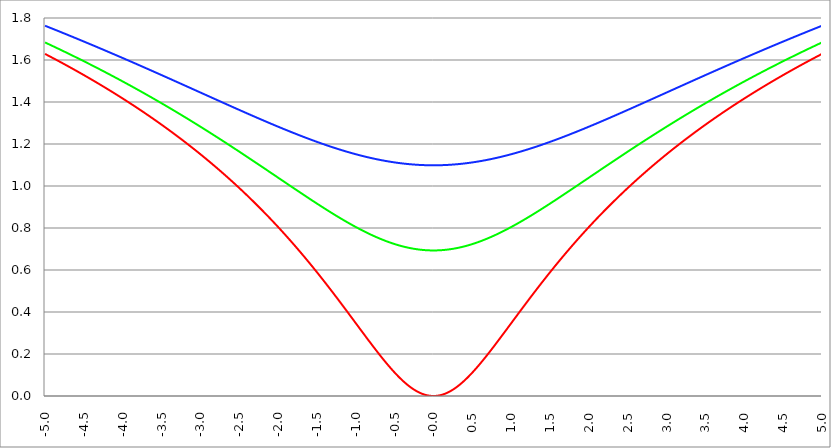
| Category | Series 1 | Series 0 | Series 2 |
|---|---|---|---|
| -5.0 | 1.629 | 1.684 | 1.763 |
| -4.995 | 1.628 | 1.683 | 1.762 |
| -4.99 | 1.627 | 1.682 | 1.762 |
| -4.985 | 1.626 | 1.681 | 1.761 |
| -4.98 | 1.625 | 1.68 | 1.76 |
| -4.975 | 1.624 | 1.679 | 1.759 |
| -4.97 | 1.623 | 1.678 | 1.759 |
| -4.965000000000001 | 1.622 | 1.678 | 1.758 |
| -4.960000000000001 | 1.621 | 1.677 | 1.757 |
| -4.955000000000001 | 1.62 | 1.676 | 1.757 |
| -4.950000000000001 | 1.619 | 1.675 | 1.756 |
| -4.945000000000001 | 1.618 | 1.674 | 1.755 |
| -4.940000000000001 | 1.617 | 1.673 | 1.754 |
| -4.935000000000001 | 1.616 | 1.672 | 1.754 |
| -4.930000000000001 | 1.615 | 1.672 | 1.753 |
| -4.925000000000002 | 1.615 | 1.671 | 1.752 |
| -4.920000000000002 | 1.614 | 1.67 | 1.751 |
| -4.915000000000002 | 1.613 | 1.669 | 1.751 |
| -4.910000000000002 | 1.612 | 1.668 | 1.75 |
| -4.905000000000002 | 1.611 | 1.667 | 1.749 |
| -4.900000000000002 | 1.61 | 1.666 | 1.748 |
| -4.895000000000002 | 1.609 | 1.665 | 1.748 |
| -4.890000000000002 | 1.608 | 1.665 | 1.747 |
| -4.885000000000002 | 1.607 | 1.664 | 1.746 |
| -4.880000000000002 | 1.606 | 1.663 | 1.745 |
| -4.875000000000003 | 1.605 | 1.662 | 1.745 |
| -4.870000000000003 | 1.604 | 1.661 | 1.744 |
| -4.865000000000003 | 1.603 | 1.66 | 1.743 |
| -4.860000000000003 | 1.602 | 1.659 | 1.742 |
| -4.855000000000003 | 1.601 | 1.658 | 1.742 |
| -4.850000000000003 | 1.6 | 1.658 | 1.741 |
| -4.845000000000003 | 1.599 | 1.657 | 1.74 |
| -4.840000000000003 | 1.598 | 1.656 | 1.739 |
| -4.835000000000003 | 1.597 | 1.655 | 1.739 |
| -4.830000000000004 | 1.596 | 1.654 | 1.738 |
| -4.825000000000004 | 1.595 | 1.653 | 1.737 |
| -4.820000000000004 | 1.594 | 1.652 | 1.736 |
| -4.815000000000004 | 1.593 | 1.651 | 1.736 |
| -4.810000000000004 | 1.592 | 1.65 | 1.735 |
| -4.805000000000004 | 1.591 | 1.65 | 1.734 |
| -4.800000000000004 | 1.59 | 1.649 | 1.733 |
| -4.795000000000004 | 1.589 | 1.648 | 1.733 |
| -4.790000000000004 | 1.588 | 1.647 | 1.732 |
| -4.785000000000004 | 1.587 | 1.646 | 1.731 |
| -4.780000000000004 | 1.586 | 1.645 | 1.73 |
| -4.775000000000004 | 1.585 | 1.644 | 1.73 |
| -4.770000000000004 | 1.584 | 1.643 | 1.729 |
| -4.765000000000005 | 1.583 | 1.642 | 1.728 |
| -4.760000000000005 | 1.582 | 1.642 | 1.727 |
| -4.755000000000005 | 1.581 | 1.641 | 1.727 |
| -4.750000000000005 | 1.58 | 1.64 | 1.726 |
| -4.745000000000005 | 1.579 | 1.639 | 1.725 |
| -4.740000000000005 | 1.578 | 1.638 | 1.724 |
| -4.735000000000005 | 1.577 | 1.637 | 1.724 |
| -4.730000000000005 | 1.576 | 1.636 | 1.723 |
| -4.725000000000006 | 1.575 | 1.635 | 1.722 |
| -4.720000000000006 | 1.574 | 1.634 | 1.721 |
| -4.715000000000006 | 1.573 | 1.633 | 1.721 |
| -4.710000000000006 | 1.572 | 1.633 | 1.72 |
| -4.705000000000006 | 1.571 | 1.632 | 1.719 |
| -4.700000000000006 | 1.57 | 1.631 | 1.718 |
| -4.695000000000006 | 1.569 | 1.63 | 1.718 |
| -4.690000000000006 | 1.568 | 1.629 | 1.717 |
| -4.685000000000007 | 1.567 | 1.628 | 1.716 |
| -4.680000000000007 | 1.566 | 1.627 | 1.715 |
| -4.675000000000007 | 1.565 | 1.626 | 1.715 |
| -4.670000000000007 | 1.564 | 1.625 | 1.714 |
| -4.665000000000007 | 1.563 | 1.624 | 1.713 |
| -4.660000000000007 | 1.562 | 1.624 | 1.712 |
| -4.655000000000007 | 1.56 | 1.623 | 1.712 |
| -4.650000000000007 | 1.559 | 1.622 | 1.711 |
| -4.645000000000007 | 1.558 | 1.621 | 1.71 |
| -4.640000000000008 | 1.557 | 1.62 | 1.709 |
| -4.635000000000008 | 1.556 | 1.619 | 1.709 |
| -4.630000000000008 | 1.555 | 1.618 | 1.708 |
| -4.625000000000008 | 1.554 | 1.617 | 1.707 |
| -4.620000000000008 | 1.553 | 1.616 | 1.706 |
| -4.615000000000008 | 1.552 | 1.615 | 1.706 |
| -4.610000000000008 | 1.551 | 1.614 | 1.705 |
| -4.605000000000008 | 1.55 | 1.614 | 1.704 |
| -4.600000000000008 | 1.549 | 1.613 | 1.703 |
| -4.595000000000009 | 1.548 | 1.612 | 1.702 |
| -4.590000000000009 | 1.547 | 1.611 | 1.702 |
| -4.585000000000009 | 1.546 | 1.61 | 1.701 |
| -4.580000000000009 | 1.545 | 1.609 | 1.7 |
| -4.57500000000001 | 1.544 | 1.608 | 1.699 |
| -4.57000000000001 | 1.543 | 1.607 | 1.699 |
| -4.565000000000009 | 1.542 | 1.606 | 1.698 |
| -4.560000000000009 | 1.541 | 1.605 | 1.697 |
| -4.555000000000009 | 1.54 | 1.604 | 1.696 |
| -4.55000000000001 | 1.539 | 1.603 | 1.696 |
| -4.54500000000001 | 1.538 | 1.603 | 1.695 |
| -4.54000000000001 | 1.537 | 1.602 | 1.694 |
| -4.53500000000001 | 1.536 | 1.601 | 1.693 |
| -4.53000000000001 | 1.535 | 1.6 | 1.693 |
| -4.52500000000001 | 1.533 | 1.599 | 1.692 |
| -4.52000000000001 | 1.532 | 1.598 | 1.691 |
| -4.51500000000001 | 1.531 | 1.597 | 1.69 |
| -4.51000000000001 | 1.53 | 1.596 | 1.689 |
| -4.505000000000011 | 1.529 | 1.595 | 1.689 |
| -4.500000000000011 | 1.528 | 1.594 | 1.688 |
| -4.495000000000011 | 1.527 | 1.593 | 1.687 |
| -4.490000000000011 | 1.526 | 1.592 | 1.686 |
| -4.485000000000011 | 1.525 | 1.591 | 1.686 |
| -4.480000000000011 | 1.524 | 1.59 | 1.685 |
| -4.475000000000011 | 1.523 | 1.59 | 1.684 |
| -4.470000000000011 | 1.522 | 1.589 | 1.683 |
| -4.465000000000011 | 1.521 | 1.588 | 1.683 |
| -4.460000000000011 | 1.52 | 1.587 | 1.682 |
| -4.455000000000012 | 1.519 | 1.586 | 1.681 |
| -4.450000000000012 | 1.518 | 1.585 | 1.68 |
| -4.445000000000012 | 1.516 | 1.584 | 1.679 |
| -4.440000000000012 | 1.515 | 1.583 | 1.679 |
| -4.435000000000012 | 1.514 | 1.582 | 1.678 |
| -4.430000000000012 | 1.513 | 1.581 | 1.677 |
| -4.425000000000012 | 1.512 | 1.58 | 1.676 |
| -4.420000000000012 | 1.511 | 1.579 | 1.676 |
| -4.415000000000012 | 1.51 | 1.578 | 1.675 |
| -4.410000000000013 | 1.509 | 1.577 | 1.674 |
| -4.405000000000013 | 1.508 | 1.576 | 1.673 |
| -4.400000000000013 | 1.507 | 1.576 | 1.672 |
| -4.395000000000013 | 1.506 | 1.575 | 1.672 |
| -4.390000000000013 | 1.505 | 1.574 | 1.671 |
| -4.385000000000013 | 1.504 | 1.573 | 1.67 |
| -4.380000000000013 | 1.502 | 1.572 | 1.669 |
| -4.375000000000013 | 1.501 | 1.571 | 1.669 |
| -4.370000000000013 | 1.5 | 1.57 | 1.668 |
| -4.365000000000013 | 1.499 | 1.569 | 1.667 |
| -4.360000000000014 | 1.498 | 1.568 | 1.666 |
| -4.355000000000014 | 1.497 | 1.567 | 1.665 |
| -4.350000000000014 | 1.496 | 1.566 | 1.665 |
| -4.345000000000014 | 1.495 | 1.565 | 1.664 |
| -4.340000000000014 | 1.494 | 1.564 | 1.663 |
| -4.335000000000014 | 1.493 | 1.563 | 1.662 |
| -4.330000000000014 | 1.492 | 1.562 | 1.662 |
| -4.325000000000014 | 1.49 | 1.561 | 1.661 |
| -4.320000000000014 | 1.489 | 1.56 | 1.66 |
| -4.315000000000015 | 1.488 | 1.559 | 1.659 |
| -4.310000000000015 | 1.487 | 1.558 | 1.658 |
| -4.305000000000015 | 1.486 | 1.557 | 1.658 |
| -4.300000000000015 | 1.485 | 1.557 | 1.657 |
| -4.295000000000015 | 1.484 | 1.556 | 1.656 |
| -4.290000000000015 | 1.483 | 1.555 | 1.655 |
| -4.285000000000015 | 1.482 | 1.554 | 1.655 |
| -4.280000000000015 | 1.481 | 1.553 | 1.654 |
| -4.275000000000015 | 1.479 | 1.552 | 1.653 |
| -4.270000000000015 | 1.478 | 1.551 | 1.652 |
| -4.265000000000016 | 1.477 | 1.55 | 1.651 |
| -4.260000000000016 | 1.476 | 1.549 | 1.651 |
| -4.255000000000016 | 1.475 | 1.548 | 1.65 |
| -4.250000000000016 | 1.474 | 1.547 | 1.649 |
| -4.245000000000016 | 1.473 | 1.546 | 1.648 |
| -4.240000000000016 | 1.472 | 1.545 | 1.648 |
| -4.235000000000016 | 1.471 | 1.544 | 1.647 |
| -4.230000000000016 | 1.469 | 1.543 | 1.646 |
| -4.225000000000017 | 1.468 | 1.542 | 1.645 |
| -4.220000000000017 | 1.467 | 1.541 | 1.644 |
| -4.215000000000017 | 1.466 | 1.54 | 1.644 |
| -4.210000000000017 | 1.465 | 1.539 | 1.643 |
| -4.205000000000017 | 1.464 | 1.538 | 1.642 |
| -4.200000000000017 | 1.463 | 1.537 | 1.641 |
| -4.195000000000017 | 1.462 | 1.536 | 1.64 |
| -4.190000000000017 | 1.46 | 1.535 | 1.64 |
| -4.185000000000017 | 1.459 | 1.534 | 1.639 |
| -4.180000000000017 | 1.458 | 1.533 | 1.638 |
| -4.175000000000018 | 1.457 | 1.532 | 1.637 |
| -4.170000000000018 | 1.456 | 1.531 | 1.636 |
| -4.165000000000018 | 1.455 | 1.53 | 1.636 |
| -4.160000000000018 | 1.454 | 1.529 | 1.635 |
| -4.155000000000018 | 1.452 | 1.529 | 1.634 |
| -4.150000000000018 | 1.451 | 1.528 | 1.633 |
| -4.145000000000018 | 1.45 | 1.527 | 1.633 |
| -4.140000000000018 | 1.449 | 1.526 | 1.632 |
| -4.135000000000018 | 1.448 | 1.525 | 1.631 |
| -4.130000000000019 | 1.447 | 1.524 | 1.63 |
| -4.125000000000019 | 1.446 | 1.523 | 1.629 |
| -4.120000000000019 | 1.444 | 1.522 | 1.629 |
| -4.115000000000019 | 1.443 | 1.521 | 1.628 |
| -4.110000000000019 | 1.442 | 1.52 | 1.627 |
| -4.105000000000019 | 1.441 | 1.519 | 1.626 |
| -4.100000000000019 | 1.44 | 1.518 | 1.625 |
| -4.095000000000019 | 1.439 | 1.517 | 1.625 |
| -4.090000000000019 | 1.438 | 1.516 | 1.624 |
| -4.085000000000019 | 1.436 | 1.515 | 1.623 |
| -4.08000000000002 | 1.435 | 1.514 | 1.622 |
| -4.07500000000002 | 1.434 | 1.513 | 1.621 |
| -4.07000000000002 | 1.433 | 1.512 | 1.621 |
| -4.06500000000002 | 1.432 | 1.511 | 1.62 |
| -4.06000000000002 | 1.431 | 1.51 | 1.619 |
| -4.05500000000002 | 1.429 | 1.509 | 1.618 |
| -4.05000000000002 | 1.428 | 1.508 | 1.617 |
| -4.04500000000002 | 1.427 | 1.507 | 1.617 |
| -4.04000000000002 | 1.426 | 1.506 | 1.616 |
| -4.03500000000002 | 1.425 | 1.505 | 1.615 |
| -4.03000000000002 | 1.424 | 1.504 | 1.614 |
| -4.025000000000021 | 1.422 | 1.503 | 1.613 |
| -4.020000000000021 | 1.421 | 1.502 | 1.613 |
| -4.015000000000021 | 1.42 | 1.501 | 1.612 |
| -4.010000000000021 | 1.419 | 1.5 | 1.611 |
| -4.005000000000021 | 1.418 | 1.499 | 1.61 |
| -4.000000000000021 | 1.417 | 1.498 | 1.609 |
| -3.995000000000021 | 1.415 | 1.497 | 1.609 |
| -3.990000000000021 | 1.414 | 1.496 | 1.608 |
| -3.985000000000022 | 1.413 | 1.495 | 1.607 |
| -3.980000000000022 | 1.412 | 1.494 | 1.606 |
| -3.975000000000022 | 1.411 | 1.493 | 1.605 |
| -3.970000000000022 | 1.41 | 1.492 | 1.605 |
| -3.965000000000022 | 1.408 | 1.491 | 1.604 |
| -3.960000000000022 | 1.407 | 1.49 | 1.603 |
| -3.955000000000022 | 1.406 | 1.489 | 1.602 |
| -3.950000000000022 | 1.405 | 1.488 | 1.601 |
| -3.945000000000022 | 1.404 | 1.487 | 1.601 |
| -3.940000000000023 | 1.402 | 1.486 | 1.6 |
| -3.935000000000023 | 1.401 | 1.485 | 1.599 |
| -3.930000000000023 | 1.4 | 1.484 | 1.598 |
| -3.925000000000023 | 1.399 | 1.483 | 1.597 |
| -3.920000000000023 | 1.398 | 1.482 | 1.597 |
| -3.915000000000023 | 1.396 | 1.481 | 1.596 |
| -3.910000000000023 | 1.395 | 1.48 | 1.595 |
| -3.905000000000023 | 1.394 | 1.479 | 1.594 |
| -3.900000000000023 | 1.393 | 1.478 | 1.593 |
| -3.895000000000023 | 1.392 | 1.477 | 1.593 |
| -3.890000000000024 | 1.39 | 1.476 | 1.592 |
| -3.885000000000024 | 1.389 | 1.475 | 1.591 |
| -3.880000000000024 | 1.388 | 1.474 | 1.59 |
| -3.875000000000024 | 1.387 | 1.473 | 1.589 |
| -3.870000000000024 | 1.386 | 1.472 | 1.589 |
| -3.865000000000024 | 1.384 | 1.471 | 1.588 |
| -3.860000000000024 | 1.383 | 1.47 | 1.587 |
| -3.855000000000024 | 1.382 | 1.469 | 1.586 |
| -3.850000000000024 | 1.381 | 1.468 | 1.585 |
| -3.845000000000025 | 1.379 | 1.467 | 1.585 |
| -3.840000000000025 | 1.378 | 1.465 | 1.584 |
| -3.835000000000025 | 1.377 | 1.464 | 1.583 |
| -3.830000000000025 | 1.376 | 1.463 | 1.582 |
| -3.825000000000025 | 1.375 | 1.462 | 1.581 |
| -3.820000000000025 | 1.373 | 1.461 | 1.58 |
| -3.815000000000025 | 1.372 | 1.46 | 1.58 |
| -3.810000000000025 | 1.371 | 1.459 | 1.579 |
| -3.805000000000025 | 1.37 | 1.458 | 1.578 |
| -3.800000000000026 | 1.368 | 1.457 | 1.577 |
| -3.795000000000026 | 1.367 | 1.456 | 1.576 |
| -3.790000000000026 | 1.366 | 1.455 | 1.576 |
| -3.785000000000026 | 1.365 | 1.454 | 1.575 |
| -3.780000000000026 | 1.364 | 1.453 | 1.574 |
| -3.775000000000026 | 1.362 | 1.452 | 1.573 |
| -3.770000000000026 | 1.361 | 1.451 | 1.572 |
| -3.765000000000026 | 1.36 | 1.45 | 1.572 |
| -3.760000000000026 | 1.359 | 1.449 | 1.571 |
| -3.755000000000026 | 1.357 | 1.448 | 1.57 |
| -3.750000000000027 | 1.356 | 1.447 | 1.569 |
| -3.745000000000027 | 1.355 | 1.446 | 1.568 |
| -3.740000000000027 | 1.354 | 1.445 | 1.567 |
| -3.735000000000027 | 1.352 | 1.444 | 1.567 |
| -3.730000000000027 | 1.351 | 1.443 | 1.566 |
| -3.725000000000027 | 1.35 | 1.442 | 1.565 |
| -3.720000000000027 | 1.349 | 1.441 | 1.564 |
| -3.715000000000027 | 1.347 | 1.44 | 1.563 |
| -3.710000000000027 | 1.346 | 1.439 | 1.563 |
| -3.705000000000028 | 1.345 | 1.438 | 1.562 |
| -3.700000000000028 | 1.344 | 1.436 | 1.561 |
| -3.695000000000028 | 1.342 | 1.435 | 1.56 |
| -3.690000000000028 | 1.341 | 1.434 | 1.559 |
| -3.685000000000028 | 1.34 | 1.433 | 1.559 |
| -3.680000000000028 | 1.339 | 1.432 | 1.558 |
| -3.675000000000028 | 1.337 | 1.431 | 1.557 |
| -3.670000000000028 | 1.336 | 1.43 | 1.556 |
| -3.665000000000028 | 1.335 | 1.429 | 1.555 |
| -3.660000000000028 | 1.333 | 1.428 | 1.554 |
| -3.655000000000029 | 1.332 | 1.427 | 1.554 |
| -3.650000000000029 | 1.331 | 1.426 | 1.553 |
| -3.645000000000029 | 1.33 | 1.425 | 1.552 |
| -3.640000000000029 | 1.328 | 1.424 | 1.551 |
| -3.635000000000029 | 1.327 | 1.423 | 1.55 |
| -3.630000000000029 | 1.326 | 1.422 | 1.55 |
| -3.625000000000029 | 1.325 | 1.421 | 1.549 |
| -3.620000000000029 | 1.323 | 1.42 | 1.548 |
| -3.615000000000029 | 1.322 | 1.419 | 1.547 |
| -3.61000000000003 | 1.321 | 1.418 | 1.546 |
| -3.60500000000003 | 1.319 | 1.416 | 1.545 |
| -3.60000000000003 | 1.318 | 1.415 | 1.545 |
| -3.59500000000003 | 1.317 | 1.414 | 1.544 |
| -3.59000000000003 | 1.316 | 1.413 | 1.543 |
| -3.58500000000003 | 1.314 | 1.412 | 1.542 |
| -3.58000000000003 | 1.313 | 1.411 | 1.541 |
| -3.57500000000003 | 1.312 | 1.41 | 1.541 |
| -3.57000000000003 | 1.31 | 1.409 | 1.54 |
| -3.565000000000031 | 1.309 | 1.408 | 1.539 |
| -3.560000000000031 | 1.308 | 1.407 | 1.538 |
| -3.555000000000031 | 1.306 | 1.406 | 1.537 |
| -3.550000000000031 | 1.305 | 1.405 | 1.536 |
| -3.545000000000031 | 1.304 | 1.404 | 1.536 |
| -3.540000000000031 | 1.303 | 1.403 | 1.535 |
| -3.535000000000031 | 1.301 | 1.402 | 1.534 |
| -3.530000000000031 | 1.3 | 1.4 | 1.533 |
| -3.525000000000031 | 1.299 | 1.399 | 1.532 |
| -3.520000000000032 | 1.297 | 1.398 | 1.531 |
| -3.515000000000032 | 1.296 | 1.397 | 1.531 |
| -3.510000000000032 | 1.295 | 1.396 | 1.53 |
| -3.505000000000032 | 1.293 | 1.395 | 1.529 |
| -3.500000000000032 | 1.292 | 1.394 | 1.528 |
| -3.495000000000032 | 1.291 | 1.393 | 1.527 |
| -3.490000000000032 | 1.289 | 1.392 | 1.527 |
| -3.485000000000032 | 1.288 | 1.391 | 1.526 |
| -3.480000000000032 | 1.287 | 1.39 | 1.525 |
| -3.475000000000032 | 1.285 | 1.389 | 1.524 |
| -3.470000000000033 | 1.284 | 1.388 | 1.523 |
| -3.465000000000033 | 1.283 | 1.386 | 1.522 |
| -3.460000000000033 | 1.281 | 1.385 | 1.522 |
| -3.455000000000033 | 1.28 | 1.384 | 1.521 |
| -3.450000000000033 | 1.279 | 1.383 | 1.52 |
| -3.445000000000033 | 1.277 | 1.382 | 1.519 |
| -3.440000000000033 | 1.276 | 1.381 | 1.518 |
| -3.435000000000033 | 1.275 | 1.38 | 1.517 |
| -3.430000000000033 | 1.273 | 1.379 | 1.517 |
| -3.425000000000034 | 1.272 | 1.378 | 1.516 |
| -3.420000000000034 | 1.271 | 1.377 | 1.515 |
| -3.415000000000034 | 1.269 | 1.376 | 1.514 |
| -3.410000000000034 | 1.268 | 1.375 | 1.513 |
| -3.405000000000034 | 1.267 | 1.373 | 1.513 |
| -3.400000000000034 | 1.265 | 1.372 | 1.512 |
| -3.395000000000034 | 1.264 | 1.371 | 1.511 |
| -3.390000000000034 | 1.263 | 1.37 | 1.51 |
| -3.385000000000034 | 1.261 | 1.369 | 1.509 |
| -3.380000000000034 | 1.26 | 1.368 | 1.508 |
| -3.375000000000035 | 1.258 | 1.367 | 1.508 |
| -3.370000000000035 | 1.257 | 1.366 | 1.507 |
| -3.365000000000035 | 1.256 | 1.365 | 1.506 |
| -3.360000000000035 | 1.254 | 1.364 | 1.505 |
| -3.355000000000035 | 1.253 | 1.362 | 1.504 |
| -3.350000000000035 | 1.252 | 1.361 | 1.503 |
| -3.345000000000035 | 1.25 | 1.36 | 1.503 |
| -3.340000000000035 | 1.249 | 1.359 | 1.502 |
| -3.335000000000035 | 1.248 | 1.358 | 1.501 |
| -3.330000000000036 | 1.246 | 1.357 | 1.5 |
| -3.325000000000036 | 1.245 | 1.356 | 1.499 |
| -3.320000000000036 | 1.243 | 1.355 | 1.498 |
| -3.315000000000036 | 1.242 | 1.354 | 1.498 |
| -3.310000000000036 | 1.241 | 1.353 | 1.497 |
| -3.305000000000036 | 1.239 | 1.351 | 1.496 |
| -3.300000000000036 | 1.238 | 1.35 | 1.495 |
| -3.295000000000036 | 1.236 | 1.349 | 1.494 |
| -3.290000000000036 | 1.235 | 1.348 | 1.493 |
| -3.285000000000036 | 1.234 | 1.347 | 1.493 |
| -3.280000000000036 | 1.232 | 1.346 | 1.492 |
| -3.275000000000037 | 1.231 | 1.345 | 1.491 |
| -3.270000000000037 | 1.229 | 1.344 | 1.49 |
| -3.265000000000037 | 1.228 | 1.343 | 1.489 |
| -3.260000000000037 | 1.227 | 1.341 | 1.488 |
| -3.255000000000037 | 1.225 | 1.34 | 1.488 |
| -3.250000000000037 | 1.224 | 1.339 | 1.487 |
| -3.245000000000037 | 1.222 | 1.338 | 1.486 |
| -3.240000000000037 | 1.221 | 1.337 | 1.485 |
| -3.235000000000038 | 1.22 | 1.336 | 1.484 |
| -3.230000000000038 | 1.218 | 1.335 | 1.483 |
| -3.225000000000038 | 1.217 | 1.334 | 1.483 |
| -3.220000000000038 | 1.215 | 1.333 | 1.482 |
| -3.215000000000038 | 1.214 | 1.331 | 1.481 |
| -3.210000000000038 | 1.213 | 1.33 | 1.48 |
| -3.205000000000038 | 1.211 | 1.329 | 1.479 |
| -3.200000000000038 | 1.21 | 1.328 | 1.478 |
| -3.195000000000038 | 1.208 | 1.327 | 1.478 |
| -3.190000000000039 | 1.207 | 1.326 | 1.477 |
| -3.185000000000039 | 1.205 | 1.325 | 1.476 |
| -3.180000000000039 | 1.204 | 1.324 | 1.475 |
| -3.175000000000039 | 1.203 | 1.322 | 1.474 |
| -3.170000000000039 | 1.201 | 1.321 | 1.474 |
| -3.16500000000004 | 1.2 | 1.32 | 1.473 |
| -3.16000000000004 | 1.198 | 1.319 | 1.472 |
| -3.155000000000039 | 1.197 | 1.318 | 1.471 |
| -3.150000000000039 | 1.195 | 1.317 | 1.47 |
| -3.14500000000004 | 1.194 | 1.316 | 1.469 |
| -3.14000000000004 | 1.193 | 1.314 | 1.469 |
| -3.13500000000004 | 1.191 | 1.313 | 1.468 |
| -3.13000000000004 | 1.19 | 1.312 | 1.467 |
| -3.12500000000004 | 1.188 | 1.311 | 1.466 |
| -3.12000000000004 | 1.187 | 1.31 | 1.465 |
| -3.11500000000004 | 1.185 | 1.309 | 1.464 |
| -3.11000000000004 | 1.184 | 1.308 | 1.464 |
| -3.10500000000004 | 1.182 | 1.307 | 1.463 |
| -3.10000000000004 | 1.181 | 1.305 | 1.462 |
| -3.095000000000041 | 1.179 | 1.304 | 1.461 |
| -3.090000000000041 | 1.178 | 1.303 | 1.46 |
| -3.085000000000041 | 1.177 | 1.302 | 1.459 |
| -3.080000000000041 | 1.175 | 1.301 | 1.459 |
| -3.075000000000041 | 1.174 | 1.3 | 1.458 |
| -3.070000000000041 | 1.172 | 1.299 | 1.457 |
| -3.065000000000041 | 1.171 | 1.297 | 1.456 |
| -3.060000000000041 | 1.169 | 1.296 | 1.455 |
| -3.055000000000041 | 1.168 | 1.295 | 1.454 |
| -3.050000000000042 | 1.166 | 1.294 | 1.454 |
| -3.045000000000042 | 1.165 | 1.293 | 1.453 |
| -3.040000000000042 | 1.163 | 1.292 | 1.452 |
| -3.035000000000042 | 1.162 | 1.291 | 1.451 |
| -3.030000000000042 | 1.16 | 1.289 | 1.45 |
| -3.025000000000042 | 1.159 | 1.288 | 1.449 |
| -3.020000000000042 | 1.157 | 1.287 | 1.449 |
| -3.015000000000042 | 1.156 | 1.286 | 1.448 |
| -3.010000000000042 | 1.154 | 1.285 | 1.447 |
| -3.005000000000043 | 1.153 | 1.284 | 1.446 |
| -3.000000000000043 | 1.151 | 1.282 | 1.445 |
| -2.995000000000043 | 1.15 | 1.281 | 1.444 |
| -2.990000000000043 | 1.148 | 1.28 | 1.444 |
| -2.985000000000043 | 1.147 | 1.279 | 1.443 |
| -2.980000000000043 | 1.145 | 1.278 | 1.442 |
| -2.975000000000043 | 1.144 | 1.277 | 1.441 |
| -2.970000000000043 | 1.142 | 1.276 | 1.44 |
| -2.965000000000043 | 1.141 | 1.274 | 1.439 |
| -2.960000000000043 | 1.139 | 1.273 | 1.439 |
| -2.955000000000044 | 1.138 | 1.272 | 1.438 |
| -2.950000000000044 | 1.136 | 1.271 | 1.437 |
| -2.945000000000044 | 1.135 | 1.27 | 1.436 |
| -2.940000000000044 | 1.133 | 1.269 | 1.435 |
| -2.935000000000044 | 1.132 | 1.267 | 1.434 |
| -2.930000000000044 | 1.13 | 1.266 | 1.434 |
| -2.925000000000044 | 1.129 | 1.265 | 1.433 |
| -2.920000000000044 | 1.127 | 1.264 | 1.432 |
| -2.915000000000044 | 1.125 | 1.263 | 1.431 |
| -2.910000000000045 | 1.124 | 1.262 | 1.43 |
| -2.905000000000045 | 1.122 | 1.26 | 1.429 |
| -2.900000000000045 | 1.121 | 1.259 | 1.429 |
| -2.895000000000045 | 1.119 | 1.258 | 1.428 |
| -2.890000000000045 | 1.118 | 1.257 | 1.427 |
| -2.885000000000045 | 1.116 | 1.256 | 1.426 |
| -2.880000000000045 | 1.115 | 1.255 | 1.425 |
| -2.875000000000045 | 1.113 | 1.253 | 1.424 |
| -2.870000000000045 | 1.112 | 1.252 | 1.424 |
| -2.865000000000045 | 1.11 | 1.251 | 1.423 |
| -2.860000000000046 | 1.108 | 1.25 | 1.422 |
| -2.855000000000046 | 1.107 | 1.249 | 1.421 |
| -2.850000000000046 | 1.105 | 1.248 | 1.42 |
| -2.845000000000046 | 1.104 | 1.246 | 1.419 |
| -2.840000000000046 | 1.102 | 1.245 | 1.419 |
| -2.835000000000046 | 1.101 | 1.244 | 1.418 |
| -2.830000000000046 | 1.099 | 1.243 | 1.417 |
| -2.825000000000046 | 1.098 | 1.242 | 1.416 |
| -2.820000000000046 | 1.096 | 1.24 | 1.415 |
| -2.815000000000047 | 1.094 | 1.239 | 1.414 |
| -2.810000000000047 | 1.093 | 1.238 | 1.414 |
| -2.805000000000047 | 1.091 | 1.237 | 1.413 |
| -2.800000000000047 | 1.09 | 1.236 | 1.412 |
| -2.795000000000047 | 1.088 | 1.235 | 1.411 |
| -2.790000000000047 | 1.086 | 1.233 | 1.41 |
| -2.785000000000047 | 1.085 | 1.232 | 1.409 |
| -2.780000000000047 | 1.083 | 1.231 | 1.409 |
| -2.775000000000047 | 1.082 | 1.23 | 1.408 |
| -2.770000000000047 | 1.08 | 1.229 | 1.407 |
| -2.765000000000048 | 1.079 | 1.227 | 1.406 |
| -2.760000000000048 | 1.077 | 1.226 | 1.405 |
| -2.755000000000048 | 1.075 | 1.225 | 1.404 |
| -2.750000000000048 | 1.074 | 1.224 | 1.404 |
| -2.745000000000048 | 1.072 | 1.223 | 1.403 |
| -2.740000000000048 | 1.07 | 1.222 | 1.402 |
| -2.735000000000048 | 1.069 | 1.22 | 1.401 |
| -2.730000000000048 | 1.067 | 1.219 | 1.4 |
| -2.725000000000048 | 1.066 | 1.218 | 1.399 |
| -2.720000000000049 | 1.064 | 1.217 | 1.399 |
| -2.715000000000049 | 1.062 | 1.216 | 1.398 |
| -2.710000000000049 | 1.061 | 1.214 | 1.397 |
| -2.705000000000049 | 1.059 | 1.213 | 1.396 |
| -2.700000000000049 | 1.058 | 1.212 | 1.395 |
| -2.695000000000049 | 1.056 | 1.211 | 1.394 |
| -2.690000000000049 | 1.054 | 1.21 | 1.394 |
| -2.685000000000049 | 1.053 | 1.208 | 1.393 |
| -2.680000000000049 | 1.051 | 1.207 | 1.392 |
| -2.675000000000049 | 1.049 | 1.206 | 1.391 |
| -2.67000000000005 | 1.048 | 1.205 | 1.39 |
| -2.66500000000005 | 1.046 | 1.204 | 1.389 |
| -2.66000000000005 | 1.044 | 1.202 | 1.389 |
| -2.65500000000005 | 1.043 | 1.201 | 1.388 |
| -2.65000000000005 | 1.041 | 1.2 | 1.387 |
| -2.64500000000005 | 1.039 | 1.199 | 1.386 |
| -2.64000000000005 | 1.038 | 1.198 | 1.385 |
| -2.63500000000005 | 1.036 | 1.196 | 1.385 |
| -2.63000000000005 | 1.034 | 1.195 | 1.384 |
| -2.625000000000051 | 1.033 | 1.194 | 1.383 |
| -2.620000000000051 | 1.031 | 1.193 | 1.382 |
| -2.615000000000051 | 1.03 | 1.192 | 1.381 |
| -2.610000000000051 | 1.028 | 1.19 | 1.38 |
| -2.605000000000051 | 1.026 | 1.189 | 1.38 |
| -2.600000000000051 | 1.024 | 1.188 | 1.379 |
| -2.595000000000051 | 1.023 | 1.187 | 1.378 |
| -2.590000000000051 | 1.021 | 1.186 | 1.377 |
| -2.585000000000051 | 1.019 | 1.184 | 1.376 |
| -2.580000000000052 | 1.018 | 1.183 | 1.375 |
| -2.575000000000052 | 1.016 | 1.182 | 1.375 |
| -2.570000000000052 | 1.014 | 1.181 | 1.374 |
| -2.565000000000052 | 1.013 | 1.179 | 1.373 |
| -2.560000000000052 | 1.011 | 1.178 | 1.372 |
| -2.555000000000052 | 1.009 | 1.177 | 1.371 |
| -2.550000000000052 | 1.008 | 1.176 | 1.371 |
| -2.545000000000052 | 1.006 | 1.175 | 1.37 |
| -2.540000000000052 | 1.004 | 1.173 | 1.369 |
| -2.535000000000053 | 1.003 | 1.172 | 1.368 |
| -2.530000000000053 | 1.001 | 1.171 | 1.367 |
| -2.525000000000053 | 0.999 | 1.17 | 1.366 |
| -2.520000000000053 | 0.997 | 1.169 | 1.366 |
| -2.515000000000053 | 0.996 | 1.167 | 1.365 |
| -2.510000000000053 | 0.994 | 1.166 | 1.364 |
| -2.505000000000053 | 0.992 | 1.165 | 1.363 |
| -2.500000000000053 | 0.991 | 1.164 | 1.362 |
| -2.495000000000053 | 0.989 | 1.162 | 1.361 |
| -2.490000000000053 | 0.987 | 1.161 | 1.361 |
| -2.485000000000054 | 0.985 | 1.16 | 1.36 |
| -2.480000000000054 | 0.984 | 1.159 | 1.359 |
| -2.475000000000054 | 0.982 | 1.158 | 1.358 |
| -2.470000000000054 | 0.98 | 1.156 | 1.357 |
| -2.465000000000054 | 0.978 | 1.155 | 1.357 |
| -2.460000000000054 | 0.977 | 1.154 | 1.356 |
| -2.455000000000054 | 0.975 | 1.153 | 1.355 |
| -2.450000000000054 | 0.973 | 1.151 | 1.354 |
| -2.445000000000054 | 0.971 | 1.15 | 1.353 |
| -2.440000000000055 | 0.97 | 1.149 | 1.352 |
| -2.435000000000055 | 0.968 | 1.148 | 1.352 |
| -2.430000000000055 | 0.966 | 1.147 | 1.351 |
| -2.425000000000055 | 0.964 | 1.145 | 1.35 |
| -2.420000000000055 | 0.963 | 1.144 | 1.349 |
| -2.415000000000055 | 0.961 | 1.143 | 1.348 |
| -2.410000000000055 | 0.959 | 1.142 | 1.348 |
| -2.405000000000055 | 0.957 | 1.14 | 1.347 |
| -2.400000000000055 | 0.956 | 1.139 | 1.346 |
| -2.395000000000055 | 0.954 | 1.138 | 1.345 |
| -2.390000000000056 | 0.952 | 1.137 | 1.344 |
| -2.385000000000056 | 0.95 | 1.135 | 1.344 |
| -2.380000000000056 | 0.948 | 1.134 | 1.343 |
| -2.375000000000056 | 0.947 | 1.133 | 1.342 |
| -2.370000000000056 | 0.945 | 1.132 | 1.341 |
| -2.365000000000056 | 0.943 | 1.131 | 1.34 |
| -2.360000000000056 | 0.941 | 1.129 | 1.339 |
| -2.355000000000056 | 0.939 | 1.128 | 1.339 |
| -2.350000000000056 | 0.938 | 1.127 | 1.338 |
| -2.345000000000057 | 0.936 | 1.126 | 1.337 |
| -2.340000000000057 | 0.934 | 1.124 | 1.336 |
| -2.335000000000057 | 0.932 | 1.123 | 1.335 |
| -2.330000000000057 | 0.93 | 1.122 | 1.335 |
| -2.325000000000057 | 0.929 | 1.121 | 1.334 |
| -2.320000000000057 | 0.927 | 1.119 | 1.333 |
| -2.315000000000057 | 0.925 | 1.118 | 1.332 |
| -2.310000000000057 | 0.923 | 1.117 | 1.331 |
| -2.305000000000057 | 0.921 | 1.116 | 1.331 |
| -2.300000000000058 | 0.919 | 1.114 | 1.33 |
| -2.295000000000058 | 0.918 | 1.113 | 1.329 |
| -2.290000000000058 | 0.916 | 1.112 | 1.328 |
| -2.285000000000058 | 0.914 | 1.111 | 1.327 |
| -2.280000000000058 | 0.912 | 1.11 | 1.327 |
| -2.275000000000058 | 0.91 | 1.108 | 1.326 |
| -2.270000000000058 | 0.908 | 1.107 | 1.325 |
| -2.265000000000058 | 0.907 | 1.106 | 1.324 |
| -2.260000000000058 | 0.905 | 1.105 | 1.323 |
| -2.255000000000058 | 0.903 | 1.103 | 1.323 |
| -2.250000000000059 | 0.901 | 1.102 | 1.322 |
| -2.245000000000059 | 0.899 | 1.101 | 1.321 |
| -2.240000000000059 | 0.897 | 1.1 | 1.32 |
| -2.235000000000059 | 0.895 | 1.098 | 1.319 |
| -2.23000000000006 | 0.894 | 1.097 | 1.319 |
| -2.22500000000006 | 0.892 | 1.096 | 1.318 |
| -2.22000000000006 | 0.89 | 1.095 | 1.317 |
| -2.215000000000059 | 0.888 | 1.093 | 1.316 |
| -2.210000000000059 | 0.886 | 1.092 | 1.315 |
| -2.20500000000006 | 0.884 | 1.091 | 1.315 |
| -2.20000000000006 | 0.882 | 1.09 | 1.314 |
| -2.19500000000006 | 0.88 | 1.088 | 1.313 |
| -2.19000000000006 | 0.879 | 1.087 | 1.312 |
| -2.18500000000006 | 0.877 | 1.086 | 1.311 |
| -2.18000000000006 | 0.875 | 1.085 | 1.311 |
| -2.17500000000006 | 0.873 | 1.083 | 1.31 |
| -2.17000000000006 | 0.871 | 1.082 | 1.309 |
| -2.16500000000006 | 0.869 | 1.081 | 1.308 |
| -2.160000000000061 | 0.867 | 1.08 | 1.307 |
| -2.155000000000061 | 0.865 | 1.078 | 1.307 |
| -2.150000000000061 | 0.863 | 1.077 | 1.306 |
| -2.145000000000061 | 0.861 | 1.076 | 1.305 |
| -2.140000000000061 | 0.86 | 1.075 | 1.304 |
| -2.135000000000061 | 0.858 | 1.073 | 1.303 |
| -2.130000000000061 | 0.856 | 1.072 | 1.303 |
| -2.125000000000061 | 0.854 | 1.071 | 1.302 |
| -2.120000000000061 | 0.852 | 1.07 | 1.301 |
| -2.115000000000061 | 0.85 | 1.068 | 1.3 |
| -2.110000000000062 | 0.848 | 1.067 | 1.3 |
| -2.105000000000062 | 0.846 | 1.066 | 1.299 |
| -2.100000000000062 | 0.844 | 1.065 | 1.298 |
| -2.095000000000062 | 0.842 | 1.063 | 1.297 |
| -2.090000000000062 | 0.84 | 1.062 | 1.296 |
| -2.085000000000062 | 0.838 | 1.061 | 1.296 |
| -2.080000000000062 | 0.836 | 1.06 | 1.295 |
| -2.075000000000062 | 0.834 | 1.058 | 1.294 |
| -2.070000000000062 | 0.832 | 1.057 | 1.293 |
| -2.065000000000063 | 0.83 | 1.056 | 1.293 |
| -2.060000000000063 | 0.829 | 1.055 | 1.292 |
| -2.055000000000063 | 0.827 | 1.053 | 1.291 |
| -2.050000000000063 | 0.825 | 1.052 | 1.29 |
| -2.045000000000063 | 0.823 | 1.051 | 1.289 |
| -2.040000000000063 | 0.821 | 1.05 | 1.289 |
| -2.035000000000063 | 0.819 | 1.048 | 1.288 |
| -2.030000000000063 | 0.817 | 1.047 | 1.287 |
| -2.025000000000063 | 0.815 | 1.046 | 1.286 |
| -2.020000000000064 | 0.813 | 1.045 | 1.286 |
| -2.015000000000064 | 0.811 | 1.043 | 1.285 |
| -2.010000000000064 | 0.809 | 1.042 | 1.284 |
| -2.005000000000064 | 0.807 | 1.041 | 1.283 |
| -2.000000000000064 | 0.805 | 1.04 | 1.282 |
| -1.995000000000064 | 0.803 | 1.038 | 1.282 |
| -1.990000000000064 | 0.801 | 1.037 | 1.281 |
| -1.985000000000064 | 0.799 | 1.036 | 1.28 |
| -1.980000000000064 | 0.797 | 1.035 | 1.279 |
| -1.975000000000064 | 0.795 | 1.033 | 1.279 |
| -1.970000000000065 | 0.793 | 1.032 | 1.278 |
| -1.965000000000065 | 0.791 | 1.031 | 1.277 |
| -1.960000000000065 | 0.789 | 1.03 | 1.276 |
| -1.955000000000065 | 0.787 | 1.028 | 1.276 |
| -1.950000000000065 | 0.785 | 1.027 | 1.275 |
| -1.945000000000065 | 0.783 | 1.026 | 1.274 |
| -1.940000000000065 | 0.781 | 1.025 | 1.273 |
| -1.935000000000065 | 0.778 | 1.023 | 1.273 |
| -1.930000000000065 | 0.776 | 1.022 | 1.272 |
| -1.925000000000066 | 0.774 | 1.021 | 1.271 |
| -1.920000000000066 | 0.772 | 1.02 | 1.27 |
| -1.915000000000066 | 0.77 | 1.018 | 1.27 |
| -1.910000000000066 | 0.768 | 1.017 | 1.269 |
| -1.905000000000066 | 0.766 | 1.016 | 1.268 |
| -1.900000000000066 | 0.764 | 1.015 | 1.267 |
| -1.895000000000066 | 0.762 | 1.013 | 1.266 |
| -1.890000000000066 | 0.76 | 1.012 | 1.266 |
| -1.885000000000066 | 0.758 | 1.011 | 1.265 |
| -1.880000000000066 | 0.756 | 1.01 | 1.264 |
| -1.875000000000067 | 0.754 | 1.008 | 1.263 |
| -1.870000000000067 | 0.752 | 1.007 | 1.263 |
| -1.865000000000067 | 0.75 | 1.006 | 1.262 |
| -1.860000000000067 | 0.748 | 1.005 | 1.261 |
| -1.855000000000067 | 0.745 | 1.004 | 1.26 |
| -1.850000000000067 | 0.743 | 1.002 | 1.26 |
| -1.845000000000067 | 0.741 | 1.001 | 1.259 |
| -1.840000000000067 | 0.739 | 1 | 1.258 |
| -1.835000000000067 | 0.737 | 0.999 | 1.258 |
| -1.830000000000068 | 0.735 | 0.997 | 1.257 |
| -1.825000000000068 | 0.733 | 0.996 | 1.256 |
| -1.820000000000068 | 0.731 | 0.995 | 1.255 |
| -1.815000000000068 | 0.729 | 0.994 | 1.255 |
| -1.810000000000068 | 0.727 | 0.992 | 1.254 |
| -1.805000000000068 | 0.724 | 0.991 | 1.253 |
| -1.800000000000068 | 0.722 | 0.99 | 1.252 |
| -1.795000000000068 | 0.72 | 0.989 | 1.252 |
| -1.790000000000068 | 0.718 | 0.987 | 1.251 |
| -1.785000000000068 | 0.716 | 0.986 | 1.25 |
| -1.780000000000069 | 0.714 | 0.985 | 1.249 |
| -1.775000000000069 | 0.712 | 0.984 | 1.249 |
| -1.770000000000069 | 0.709 | 0.982 | 1.248 |
| -1.765000000000069 | 0.707 | 0.981 | 1.247 |
| -1.760000000000069 | 0.705 | 0.98 | 1.247 |
| -1.75500000000007 | 0.703 | 0.979 | 1.246 |
| -1.75000000000007 | 0.701 | 0.977 | 1.245 |
| -1.745000000000069 | 0.699 | 0.976 | 1.244 |
| -1.740000000000069 | 0.697 | 0.975 | 1.244 |
| -1.73500000000007 | 0.694 | 0.974 | 1.243 |
| -1.73000000000007 | 0.692 | 0.972 | 1.242 |
| -1.72500000000007 | 0.69 | 0.971 | 1.241 |
| -1.72000000000007 | 0.688 | 0.97 | 1.241 |
| -1.71500000000007 | 0.686 | 0.969 | 1.24 |
| -1.71000000000007 | 0.684 | 0.968 | 1.239 |
| -1.70500000000007 | 0.681 | 0.966 | 1.239 |
| -1.70000000000007 | 0.679 | 0.965 | 1.238 |
| -1.69500000000007 | 0.677 | 0.964 | 1.237 |
| -1.69000000000007 | 0.675 | 0.963 | 1.236 |
| -1.685000000000071 | 0.673 | 0.961 | 1.236 |
| -1.680000000000071 | 0.67 | 0.96 | 1.235 |
| -1.675000000000071 | 0.668 | 0.959 | 1.234 |
| -1.670000000000071 | 0.666 | 0.958 | 1.234 |
| -1.665000000000071 | 0.664 | 0.956 | 1.233 |
| -1.660000000000071 | 0.662 | 0.955 | 1.232 |
| -1.655000000000071 | 0.659 | 0.954 | 1.231 |
| -1.650000000000071 | 0.657 | 0.953 | 1.231 |
| -1.645000000000071 | 0.655 | 0.952 | 1.23 |
| -1.640000000000072 | 0.653 | 0.95 | 1.229 |
| -1.635000000000072 | 0.651 | 0.949 | 1.229 |
| -1.630000000000072 | 0.648 | 0.948 | 1.228 |
| -1.625000000000072 | 0.646 | 0.947 | 1.227 |
| -1.620000000000072 | 0.644 | 0.945 | 1.227 |
| -1.615000000000072 | 0.642 | 0.944 | 1.226 |
| -1.610000000000072 | 0.639 | 0.943 | 1.225 |
| -1.605000000000072 | 0.637 | 0.942 | 1.224 |
| -1.600000000000072 | 0.635 | 0.94 | 1.224 |
| -1.595000000000073 | 0.633 | 0.939 | 1.223 |
| -1.590000000000073 | 0.63 | 0.938 | 1.222 |
| -1.585000000000073 | 0.628 | 0.937 | 1.222 |
| -1.580000000000073 | 0.626 | 0.936 | 1.221 |
| -1.575000000000073 | 0.624 | 0.934 | 1.22 |
| -1.570000000000073 | 0.621 | 0.933 | 1.22 |
| -1.565000000000073 | 0.619 | 0.932 | 1.219 |
| -1.560000000000073 | 0.617 | 0.931 | 1.218 |
| -1.555000000000073 | 0.615 | 0.93 | 1.218 |
| -1.550000000000074 | 0.612 | 0.928 | 1.217 |
| -1.545000000000074 | 0.61 | 0.927 | 1.216 |
| -1.540000000000074 | 0.608 | 0.926 | 1.216 |
| -1.535000000000074 | 0.605 | 0.925 | 1.215 |
| -1.530000000000074 | 0.603 | 0.924 | 1.214 |
| -1.525000000000074 | 0.601 | 0.922 | 1.214 |
| -1.520000000000074 | 0.599 | 0.921 | 1.213 |
| -1.515000000000074 | 0.596 | 0.92 | 1.212 |
| -1.510000000000074 | 0.594 | 0.919 | 1.212 |
| -1.505000000000074 | 0.592 | 0.917 | 1.211 |
| -1.500000000000075 | 0.589 | 0.916 | 1.21 |
| -1.495000000000075 | 0.587 | 0.915 | 1.21 |
| -1.490000000000075 | 0.585 | 0.914 | 1.209 |
| -1.485000000000075 | 0.582 | 0.913 | 1.208 |
| -1.480000000000075 | 0.58 | 0.911 | 1.208 |
| -1.475000000000075 | 0.578 | 0.91 | 1.207 |
| -1.470000000000075 | 0.575 | 0.909 | 1.206 |
| -1.465000000000075 | 0.573 | 0.908 | 1.206 |
| -1.460000000000075 | 0.571 | 0.907 | 1.205 |
| -1.455000000000076 | 0.568 | 0.906 | 1.204 |
| -1.450000000000076 | 0.566 | 0.904 | 1.204 |
| -1.445000000000076 | 0.564 | 0.903 | 1.203 |
| -1.440000000000076 | 0.561 | 0.902 | 1.202 |
| -1.435000000000076 | 0.559 | 0.901 | 1.202 |
| -1.430000000000076 | 0.557 | 0.9 | 1.201 |
| -1.425000000000076 | 0.554 | 0.898 | 1.2 |
| -1.420000000000076 | 0.552 | 0.897 | 1.2 |
| -1.415000000000076 | 0.55 | 0.896 | 1.199 |
| -1.410000000000077 | 0.547 | 0.895 | 1.198 |
| -1.405000000000077 | 0.545 | 0.894 | 1.198 |
| -1.400000000000077 | 0.543 | 0.893 | 1.197 |
| -1.395000000000077 | 0.54 | 0.891 | 1.196 |
| -1.390000000000077 | 0.538 | 0.89 | 1.196 |
| -1.385000000000077 | 0.535 | 0.889 | 1.195 |
| -1.380000000000077 | 0.533 | 0.888 | 1.195 |
| -1.375000000000077 | 0.531 | 0.887 | 1.194 |
| -1.370000000000077 | 0.528 | 0.886 | 1.193 |
| -1.365000000000077 | 0.526 | 0.884 | 1.193 |
| -1.360000000000078 | 0.524 | 0.883 | 1.192 |
| -1.355000000000078 | 0.521 | 0.882 | 1.191 |
| -1.350000000000078 | 0.519 | 0.881 | 1.191 |
| -1.345000000000078 | 0.516 | 0.88 | 1.19 |
| -1.340000000000078 | 0.514 | 0.879 | 1.19 |
| -1.335000000000078 | 0.512 | 0.877 | 1.189 |
| -1.330000000000078 | 0.509 | 0.876 | 1.188 |
| -1.325000000000078 | 0.507 | 0.875 | 1.188 |
| -1.320000000000078 | 0.504 | 0.874 | 1.187 |
| -1.315000000000079 | 0.502 | 0.873 | 1.186 |
| -1.310000000000079 | 0.5 | 0.872 | 1.186 |
| -1.305000000000079 | 0.497 | 0.87 | 1.185 |
| -1.300000000000079 | 0.495 | 0.869 | 1.185 |
| -1.295000000000079 | 0.492 | 0.868 | 1.184 |
| -1.29000000000008 | 0.49 | 0.867 | 1.183 |
| -1.285000000000079 | 0.488 | 0.866 | 1.183 |
| -1.280000000000079 | 0.485 | 0.865 | 1.182 |
| -1.275000000000079 | 0.483 | 0.864 | 1.182 |
| -1.270000000000079 | 0.48 | 0.863 | 1.181 |
| -1.26500000000008 | 0.478 | 0.861 | 1.18 |
| -1.26000000000008 | 0.475 | 0.86 | 1.18 |
| -1.25500000000008 | 0.473 | 0.859 | 1.179 |
| -1.25000000000008 | 0.47 | 0.858 | 1.179 |
| -1.24500000000008 | 0.468 | 0.857 | 1.178 |
| -1.24000000000008 | 0.466 | 0.856 | 1.177 |
| -1.23500000000008 | 0.463 | 0.855 | 1.177 |
| -1.23000000000008 | 0.461 | 0.854 | 1.176 |
| -1.22500000000008 | 0.458 | 0.852 | 1.176 |
| -1.220000000000081 | 0.456 | 0.851 | 1.175 |
| -1.215000000000081 | 0.453 | 0.85 | 1.175 |
| -1.210000000000081 | 0.451 | 0.849 | 1.174 |
| -1.205000000000081 | 0.448 | 0.848 | 1.173 |
| -1.200000000000081 | 0.446 | 0.847 | 1.173 |
| -1.195000000000081 | 0.444 | 0.846 | 1.172 |
| -1.190000000000081 | 0.441 | 0.845 | 1.172 |
| -1.185000000000081 | 0.439 | 0.844 | 1.171 |
| -1.180000000000081 | 0.436 | 0.842 | 1.171 |
| -1.175000000000082 | 0.434 | 0.841 | 1.17 |
| -1.170000000000082 | 0.431 | 0.84 | 1.169 |
| -1.165000000000082 | 0.429 | 0.839 | 1.169 |
| -1.160000000000082 | 0.426 | 0.838 | 1.168 |
| -1.155000000000082 | 0.424 | 0.837 | 1.168 |
| -1.150000000000082 | 0.421 | 0.836 | 1.167 |
| -1.145000000000082 | 0.419 | 0.835 | 1.167 |
| -1.140000000000082 | 0.416 | 0.834 | 1.166 |
| -1.135000000000082 | 0.414 | 0.833 | 1.166 |
| -1.130000000000082 | 0.411 | 0.832 | 1.165 |
| -1.125000000000083 | 0.409 | 0.831 | 1.164 |
| -1.120000000000083 | 0.406 | 0.83 | 1.164 |
| -1.115000000000083 | 0.404 | 0.828 | 1.163 |
| -1.110000000000083 | 0.401 | 0.827 | 1.163 |
| -1.105000000000083 | 0.399 | 0.826 | 1.162 |
| -1.100000000000083 | 0.396 | 0.825 | 1.162 |
| -1.095000000000083 | 0.394 | 0.824 | 1.161 |
| -1.090000000000083 | 0.392 | 0.823 | 1.161 |
| -1.085000000000083 | 0.389 | 0.822 | 1.16 |
| -1.080000000000084 | 0.387 | 0.821 | 1.16 |
| -1.075000000000084 | 0.384 | 0.82 | 1.159 |
| -1.070000000000084 | 0.382 | 0.819 | 1.158 |
| -1.065000000000084 | 0.379 | 0.818 | 1.158 |
| -1.060000000000084 | 0.377 | 0.817 | 1.157 |
| -1.055000000000084 | 0.374 | 0.816 | 1.157 |
| -1.050000000000084 | 0.372 | 0.815 | 1.156 |
| -1.045000000000084 | 0.369 | 0.814 | 1.156 |
| -1.040000000000084 | 0.367 | 0.813 | 1.155 |
| -1.035000000000085 | 0.364 | 0.812 | 1.155 |
| -1.030000000000085 | 0.362 | 0.811 | 1.154 |
| -1.025000000000085 | 0.359 | 0.81 | 1.154 |
| -1.020000000000085 | 0.357 | 0.809 | 1.153 |
| -1.015000000000085 | 0.354 | 0.808 | 1.153 |
| -1.010000000000085 | 0.352 | 0.807 | 1.152 |
| -1.005000000000085 | 0.349 | 0.806 | 1.152 |
| -1.000000000000085 | 0.347 | 0.805 | 1.151 |
| -0.995000000000085 | 0.344 | 0.804 | 1.151 |
| -0.990000000000085 | 0.342 | 0.803 | 1.15 |
| -0.985000000000085 | 0.339 | 0.802 | 1.15 |
| -0.980000000000085 | 0.337 | 0.801 | 1.149 |
| -0.975000000000085 | 0.334 | 0.8 | 1.149 |
| -0.970000000000085 | 0.332 | 0.799 | 1.148 |
| -0.965000000000085 | 0.329 | 0.798 | 1.148 |
| -0.960000000000085 | 0.327 | 0.797 | 1.147 |
| -0.955000000000085 | 0.324 | 0.796 | 1.147 |
| -0.950000000000085 | 0.322 | 0.795 | 1.146 |
| -0.945000000000085 | 0.319 | 0.794 | 1.146 |
| -0.940000000000085 | 0.317 | 0.793 | 1.145 |
| -0.935000000000085 | 0.314 | 0.792 | 1.145 |
| -0.930000000000085 | 0.312 | 0.791 | 1.144 |
| -0.925000000000085 | 0.309 | 0.79 | 1.144 |
| -0.920000000000085 | 0.307 | 0.789 | 1.144 |
| -0.915000000000085 | 0.304 | 0.788 | 1.143 |
| -0.910000000000085 | 0.302 | 0.787 | 1.143 |
| -0.905000000000085 | 0.299 | 0.786 | 1.142 |
| -0.900000000000085 | 0.297 | 0.785 | 1.142 |
| -0.895000000000085 | 0.294 | 0.784 | 1.141 |
| -0.890000000000085 | 0.292 | 0.783 | 1.141 |
| -0.885000000000085 | 0.289 | 0.783 | 1.14 |
| -0.880000000000085 | 0.287 | 0.782 | 1.14 |
| -0.875000000000085 | 0.284 | 0.781 | 1.139 |
| -0.870000000000085 | 0.282 | 0.78 | 1.139 |
| -0.865000000000085 | 0.279 | 0.779 | 1.139 |
| -0.860000000000085 | 0.277 | 0.778 | 1.138 |
| -0.855000000000085 | 0.274 | 0.777 | 1.138 |
| -0.850000000000085 | 0.272 | 0.776 | 1.137 |
| -0.845000000000085 | 0.269 | 0.775 | 1.137 |
| -0.840000000000085 | 0.267 | 0.774 | 1.136 |
| -0.835000000000085 | 0.264 | 0.773 | 1.136 |
| -0.830000000000085 | 0.262 | 0.773 | 1.135 |
| -0.825000000000085 | 0.26 | 0.772 | 1.135 |
| -0.820000000000085 | 0.257 | 0.771 | 1.135 |
| -0.815000000000085 | 0.255 | 0.77 | 1.134 |
| -0.810000000000085 | 0.252 | 0.769 | 1.134 |
| -0.805000000000085 | 0.25 | 0.768 | 1.133 |
| -0.800000000000085 | 0.247 | 0.767 | 1.133 |
| -0.795000000000085 | 0.245 | 0.766 | 1.133 |
| -0.790000000000085 | 0.242 | 0.766 | 1.132 |
| -0.785000000000085 | 0.24 | 0.765 | 1.132 |
| -0.780000000000085 | 0.238 | 0.764 | 1.131 |
| -0.775000000000085 | 0.235 | 0.763 | 1.131 |
| -0.770000000000085 | 0.233 | 0.762 | 1.131 |
| -0.765000000000085 | 0.23 | 0.761 | 1.13 |
| -0.760000000000085 | 0.228 | 0.761 | 1.13 |
| -0.755000000000085 | 0.226 | 0.76 | 1.129 |
| -0.750000000000085 | 0.223 | 0.759 | 1.129 |
| -0.745000000000085 | 0.221 | 0.758 | 1.129 |
| -0.740000000000085 | 0.218 | 0.757 | 1.128 |
| -0.735000000000085 | 0.216 | 0.756 | 1.128 |
| -0.730000000000085 | 0.214 | 0.756 | 1.127 |
| -0.725000000000085 | 0.211 | 0.755 | 1.127 |
| -0.720000000000085 | 0.209 | 0.754 | 1.127 |
| -0.715000000000085 | 0.206 | 0.753 | 1.126 |
| -0.710000000000085 | 0.204 | 0.752 | 1.126 |
| -0.705000000000085 | 0.202 | 0.752 | 1.125 |
| -0.700000000000085 | 0.199 | 0.751 | 1.125 |
| -0.695000000000085 | 0.197 | 0.75 | 1.125 |
| -0.690000000000085 | 0.195 | 0.749 | 1.124 |
| -0.685000000000085 | 0.192 | 0.749 | 1.124 |
| -0.680000000000085 | 0.19 | 0.748 | 1.124 |
| -0.675000000000085 | 0.188 | 0.747 | 1.123 |
| -0.670000000000085 | 0.185 | 0.746 | 1.123 |
| -0.665000000000085 | 0.183 | 0.746 | 1.123 |
| -0.660000000000085 | 0.181 | 0.745 | 1.122 |
| -0.655000000000085 | 0.178 | 0.744 | 1.122 |
| -0.650000000000085 | 0.176 | 0.743 | 1.122 |
| -0.645000000000085 | 0.174 | 0.743 | 1.121 |
| -0.640000000000085 | 0.172 | 0.742 | 1.121 |
| -0.635000000000085 | 0.169 | 0.741 | 1.121 |
| -0.630000000000085 | 0.167 | 0.74 | 1.12 |
| -0.625000000000085 | 0.165 | 0.74 | 1.12 |
| -0.620000000000085 | 0.163 | 0.739 | 1.12 |
| -0.615000000000085 | 0.16 | 0.738 | 1.119 |
| -0.610000000000085 | 0.158 | 0.738 | 1.119 |
| -0.605000000000085 | 0.156 | 0.737 | 1.119 |
| -0.600000000000085 | 0.154 | 0.736 | 1.118 |
| -0.595000000000085 | 0.152 | 0.736 | 1.118 |
| -0.590000000000085 | 0.149 | 0.735 | 1.118 |
| -0.585000000000085 | 0.147 | 0.734 | 1.117 |
| -0.580000000000085 | 0.145 | 0.734 | 1.117 |
| -0.575000000000085 | 0.143 | 0.733 | 1.117 |
| -0.570000000000085 | 0.141 | 0.732 | 1.116 |
| -0.565000000000085 | 0.139 | 0.732 | 1.116 |
| -0.560000000000085 | 0.136 | 0.731 | 1.116 |
| -0.555000000000085 | 0.134 | 0.73 | 1.115 |
| -0.550000000000085 | 0.132 | 0.73 | 1.115 |
| -0.545000000000085 | 0.13 | 0.729 | 1.115 |
| -0.540000000000085 | 0.128 | 0.728 | 1.115 |
| -0.535000000000085 | 0.126 | 0.728 | 1.114 |
| -0.530000000000085 | 0.124 | 0.727 | 1.114 |
| -0.525000000000085 | 0.122 | 0.726 | 1.114 |
| -0.520000000000085 | 0.12 | 0.726 | 1.113 |
| -0.515000000000085 | 0.118 | 0.725 | 1.113 |
| -0.510000000000085 | 0.116 | 0.725 | 1.113 |
| -0.505000000000085 | 0.114 | 0.724 | 1.113 |
| -0.500000000000085 | 0.112 | 0.723 | 1.112 |
| -0.495000000000085 | 0.11 | 0.723 | 1.112 |
| -0.490000000000085 | 0.108 | 0.722 | 1.112 |
| -0.485000000000085 | 0.106 | 0.722 | 1.112 |
| -0.480000000000085 | 0.104 | 0.721 | 1.111 |
| -0.475000000000085 | 0.102 | 0.721 | 1.111 |
| -0.470000000000085 | 0.1 | 0.72 | 1.111 |
| -0.465000000000085 | 0.098 | 0.719 | 1.11 |
| -0.460000000000085 | 0.096 | 0.719 | 1.11 |
| -0.455000000000085 | 0.094 | 0.718 | 1.11 |
| -0.450000000000085 | 0.092 | 0.718 | 1.11 |
| -0.445000000000085 | 0.09 | 0.717 | 1.109 |
| -0.440000000000085 | 0.088 | 0.717 | 1.109 |
| -0.435000000000085 | 0.087 | 0.716 | 1.109 |
| -0.430000000000085 | 0.085 | 0.716 | 1.109 |
| -0.425000000000085 | 0.083 | 0.715 | 1.109 |
| -0.420000000000085 | 0.081 | 0.715 | 1.108 |
| -0.415000000000085 | 0.079 | 0.714 | 1.108 |
| -0.410000000000085 | 0.078 | 0.714 | 1.108 |
| -0.405000000000085 | 0.076 | 0.713 | 1.108 |
| -0.400000000000085 | 0.074 | 0.713 | 1.107 |
| -0.395000000000085 | 0.072 | 0.712 | 1.107 |
| -0.390000000000085 | 0.071 | 0.712 | 1.107 |
| -0.385000000000085 | 0.069 | 0.711 | 1.107 |
| -0.380000000000085 | 0.067 | 0.711 | 1.107 |
| -0.375000000000085 | 0.066 | 0.71 | 1.106 |
| -0.370000000000085 | 0.064 | 0.71 | 1.106 |
| -0.365000000000085 | 0.063 | 0.71 | 1.106 |
| -0.360000000000085 | 0.061 | 0.709 | 1.106 |
| -0.355000000000085 | 0.059 | 0.709 | 1.106 |
| -0.350000000000085 | 0.058 | 0.708 | 1.105 |
| -0.345000000000085 | 0.056 | 0.708 | 1.105 |
| -0.340000000000085 | 0.055 | 0.707 | 1.105 |
| -0.335000000000085 | 0.053 | 0.707 | 1.105 |
| -0.330000000000085 | 0.052 | 0.707 | 1.105 |
| -0.325000000000085 | 0.05 | 0.706 | 1.104 |
| -0.320000000000085 | 0.049 | 0.706 | 1.104 |
| -0.315000000000085 | 0.047 | 0.705 | 1.104 |
| -0.310000000000085 | 0.046 | 0.705 | 1.104 |
| -0.305000000000085 | 0.044 | 0.705 | 1.104 |
| -0.300000000000085 | 0.043 | 0.704 | 1.104 |
| -0.295000000000085 | 0.042 | 0.704 | 1.103 |
| -0.290000000000085 | 0.04 | 0.704 | 1.103 |
| -0.285000000000085 | 0.039 | 0.703 | 1.103 |
| -0.280000000000085 | 0.038 | 0.703 | 1.103 |
| -0.275000000000085 | 0.036 | 0.703 | 1.103 |
| -0.270000000000085 | 0.035 | 0.702 | 1.103 |
| -0.265000000000085 | 0.034 | 0.702 | 1.102 |
| -0.260000000000085 | 0.033 | 0.702 | 1.102 |
| -0.255000000000085 | 0.031 | 0.701 | 1.102 |
| -0.250000000000085 | 0.03 | 0.701 | 1.102 |
| -0.245000000000085 | 0.029 | 0.701 | 1.102 |
| -0.240000000000085 | 0.028 | 0.7 | 1.102 |
| -0.235000000000085 | 0.027 | 0.7 | 1.102 |
| -0.230000000000085 | 0.026 | 0.7 | 1.102 |
| -0.225000000000085 | 0.025 | 0.699 | 1.101 |
| -0.220000000000085 | 0.024 | 0.699 | 1.101 |
| -0.215000000000085 | 0.023 | 0.699 | 1.101 |
| -0.210000000000085 | 0.022 | 0.699 | 1.101 |
| -0.205000000000085 | 0.021 | 0.698 | 1.101 |
| -0.200000000000085 | 0.02 | 0.698 | 1.101 |
| -0.195000000000085 | 0.019 | 0.698 | 1.101 |
| -0.190000000000085 | 0.018 | 0.698 | 1.101 |
| -0.185000000000085 | 0.017 | 0.697 | 1.101 |
| -0.180000000000085 | 0.016 | 0.697 | 1.1 |
| -0.175000000000085 | 0.015 | 0.697 | 1.1 |
| -0.170000000000085 | 0.014 | 0.697 | 1.1 |
| -0.165000000000085 | 0.013 | 0.697 | 1.1 |
| -0.160000000000085 | 0.013 | 0.696 | 1.1 |
| -0.155000000000084 | 0.012 | 0.696 | 1.1 |
| -0.150000000000084 | 0.011 | 0.696 | 1.1 |
| -0.145000000000084 | 0.01 | 0.696 | 1.1 |
| -0.140000000000084 | 0.01 | 0.696 | 1.1 |
| -0.135000000000084 | 0.009 | 0.695 | 1.1 |
| -0.130000000000084 | 0.008 | 0.695 | 1.1 |
| -0.125000000000084 | 0.008 | 0.695 | 1.099 |
| -0.120000000000084 | 0.007 | 0.695 | 1.099 |
| -0.115000000000084 | 0.007 | 0.695 | 1.099 |
| -0.110000000000084 | 0.006 | 0.695 | 1.099 |
| -0.105000000000084 | 0.005 | 0.695 | 1.099 |
| -0.100000000000084 | 0.005 | 0.694 | 1.099 |
| -0.0950000000000844 | 0.004 | 0.694 | 1.099 |
| -0.0900000000000844 | 0.004 | 0.694 | 1.099 |
| -0.0850000000000844 | 0.004 | 0.694 | 1.099 |
| -0.0800000000000844 | 0.003 | 0.694 | 1.099 |
| -0.0750000000000844 | 0.003 | 0.694 | 1.099 |
| -0.0700000000000844 | 0.002 | 0.694 | 1.099 |
| -0.0650000000000844 | 0.002 | 0.694 | 1.099 |
| -0.0600000000000844 | 0.002 | 0.694 | 1.099 |
| -0.0550000000000844 | 0.002 | 0.694 | 1.099 |
| -0.0500000000000844 | 0.001 | 0.693 | 1.099 |
| -0.0450000000000844 | 0.001 | 0.693 | 1.099 |
| -0.0400000000000844 | 0.001 | 0.693 | 1.099 |
| -0.0350000000000844 | 0.001 | 0.693 | 1.099 |
| -0.0300000000000844 | 0 | 0.693 | 1.099 |
| -0.0250000000000844 | 0 | 0.693 | 1.099 |
| -0.0200000000000844 | 0 | 0.693 | 1.099 |
| -0.0150000000000844 | 0 | 0.693 | 1.099 |
| -0.0100000000000844 | 0 | 0.693 | 1.099 |
| -0.00500000000008444 | 0 | 0.693 | 1.099 |
| -8.4444604087075e-14 | 0 | 0.693 | 1.099 |
| 0.00499999999991555 | 0 | 0.693 | 1.099 |
| 0.00999999999991555 | 0 | 0.693 | 1.099 |
| 0.0149999999999156 | 0 | 0.693 | 1.099 |
| 0.0199999999999156 | 0 | 0.693 | 1.099 |
| 0.0249999999999156 | 0 | 0.693 | 1.099 |
| 0.0299999999999156 | 0 | 0.693 | 1.099 |
| 0.0349999999999155 | 0.001 | 0.693 | 1.099 |
| 0.0399999999999155 | 0.001 | 0.693 | 1.099 |
| 0.0449999999999155 | 0.001 | 0.693 | 1.099 |
| 0.0499999999999155 | 0.001 | 0.693 | 1.099 |
| 0.0549999999999155 | 0.002 | 0.694 | 1.099 |
| 0.0599999999999155 | 0.002 | 0.694 | 1.099 |
| 0.0649999999999155 | 0.002 | 0.694 | 1.099 |
| 0.0699999999999155 | 0.002 | 0.694 | 1.099 |
| 0.0749999999999155 | 0.003 | 0.694 | 1.099 |
| 0.0799999999999155 | 0.003 | 0.694 | 1.099 |
| 0.0849999999999155 | 0.004 | 0.694 | 1.099 |
| 0.0899999999999155 | 0.004 | 0.694 | 1.099 |
| 0.0949999999999155 | 0.004 | 0.694 | 1.099 |
| 0.0999999999999155 | 0.005 | 0.694 | 1.099 |
| 0.104999999999916 | 0.005 | 0.695 | 1.099 |
| 0.109999999999916 | 0.006 | 0.695 | 1.099 |
| 0.114999999999916 | 0.007 | 0.695 | 1.099 |
| 0.119999999999916 | 0.007 | 0.695 | 1.099 |
| 0.124999999999916 | 0.008 | 0.695 | 1.099 |
| 0.129999999999916 | 0.008 | 0.695 | 1.1 |
| 0.134999999999916 | 0.009 | 0.695 | 1.1 |
| 0.139999999999916 | 0.01 | 0.696 | 1.1 |
| 0.144999999999916 | 0.01 | 0.696 | 1.1 |
| 0.149999999999916 | 0.011 | 0.696 | 1.1 |
| 0.154999999999916 | 0.012 | 0.696 | 1.1 |
| 0.159999999999916 | 0.013 | 0.696 | 1.1 |
| 0.164999999999916 | 0.013 | 0.697 | 1.1 |
| 0.169999999999916 | 0.014 | 0.697 | 1.1 |
| 0.174999999999916 | 0.015 | 0.697 | 1.1 |
| 0.179999999999916 | 0.016 | 0.697 | 1.1 |
| 0.184999999999916 | 0.017 | 0.697 | 1.101 |
| 0.189999999999916 | 0.018 | 0.698 | 1.101 |
| 0.194999999999916 | 0.019 | 0.698 | 1.101 |
| 0.199999999999916 | 0.02 | 0.698 | 1.101 |
| 0.204999999999916 | 0.021 | 0.698 | 1.101 |
| 0.209999999999916 | 0.022 | 0.699 | 1.101 |
| 0.214999999999916 | 0.023 | 0.699 | 1.101 |
| 0.219999999999916 | 0.024 | 0.699 | 1.101 |
| 0.224999999999916 | 0.025 | 0.699 | 1.101 |
| 0.229999999999916 | 0.026 | 0.7 | 1.102 |
| 0.234999999999916 | 0.027 | 0.7 | 1.102 |
| 0.239999999999916 | 0.028 | 0.7 | 1.102 |
| 0.244999999999916 | 0.029 | 0.701 | 1.102 |
| 0.249999999999916 | 0.03 | 0.701 | 1.102 |
| 0.254999999999916 | 0.031 | 0.701 | 1.102 |
| 0.259999999999916 | 0.033 | 0.702 | 1.102 |
| 0.264999999999916 | 0.034 | 0.702 | 1.102 |
| 0.269999999999916 | 0.035 | 0.702 | 1.103 |
| 0.274999999999916 | 0.036 | 0.703 | 1.103 |
| 0.279999999999916 | 0.038 | 0.703 | 1.103 |
| 0.284999999999916 | 0.039 | 0.703 | 1.103 |
| 0.289999999999916 | 0.04 | 0.704 | 1.103 |
| 0.294999999999916 | 0.042 | 0.704 | 1.103 |
| 0.299999999999916 | 0.043 | 0.704 | 1.104 |
| 0.304999999999916 | 0.044 | 0.705 | 1.104 |
| 0.309999999999916 | 0.046 | 0.705 | 1.104 |
| 0.314999999999916 | 0.047 | 0.705 | 1.104 |
| 0.319999999999916 | 0.049 | 0.706 | 1.104 |
| 0.324999999999916 | 0.05 | 0.706 | 1.104 |
| 0.329999999999916 | 0.052 | 0.707 | 1.105 |
| 0.334999999999916 | 0.053 | 0.707 | 1.105 |
| 0.339999999999916 | 0.055 | 0.707 | 1.105 |
| 0.344999999999916 | 0.056 | 0.708 | 1.105 |
| 0.349999999999916 | 0.058 | 0.708 | 1.105 |
| 0.354999999999916 | 0.059 | 0.709 | 1.106 |
| 0.359999999999916 | 0.061 | 0.709 | 1.106 |
| 0.364999999999916 | 0.063 | 0.71 | 1.106 |
| 0.369999999999916 | 0.064 | 0.71 | 1.106 |
| 0.374999999999916 | 0.066 | 0.71 | 1.106 |
| 0.379999999999916 | 0.067 | 0.711 | 1.107 |
| 0.384999999999916 | 0.069 | 0.711 | 1.107 |
| 0.389999999999916 | 0.071 | 0.712 | 1.107 |
| 0.394999999999916 | 0.072 | 0.712 | 1.107 |
| 0.399999999999916 | 0.074 | 0.713 | 1.107 |
| 0.404999999999916 | 0.076 | 0.713 | 1.108 |
| 0.409999999999916 | 0.078 | 0.714 | 1.108 |
| 0.414999999999916 | 0.079 | 0.714 | 1.108 |
| 0.419999999999916 | 0.081 | 0.715 | 1.108 |
| 0.424999999999916 | 0.083 | 0.715 | 1.109 |
| 0.429999999999916 | 0.085 | 0.716 | 1.109 |
| 0.434999999999916 | 0.087 | 0.716 | 1.109 |
| 0.439999999999916 | 0.088 | 0.717 | 1.109 |
| 0.444999999999916 | 0.09 | 0.717 | 1.109 |
| 0.449999999999916 | 0.092 | 0.718 | 1.11 |
| 0.454999999999916 | 0.094 | 0.718 | 1.11 |
| 0.459999999999916 | 0.096 | 0.719 | 1.11 |
| 0.464999999999916 | 0.098 | 0.719 | 1.11 |
| 0.469999999999916 | 0.1 | 0.72 | 1.111 |
| 0.474999999999916 | 0.102 | 0.721 | 1.111 |
| 0.479999999999916 | 0.104 | 0.721 | 1.111 |
| 0.484999999999916 | 0.106 | 0.722 | 1.112 |
| 0.489999999999916 | 0.108 | 0.722 | 1.112 |
| 0.494999999999916 | 0.11 | 0.723 | 1.112 |
| 0.499999999999916 | 0.112 | 0.723 | 1.112 |
| 0.504999999999916 | 0.114 | 0.724 | 1.113 |
| 0.509999999999916 | 0.116 | 0.725 | 1.113 |
| 0.514999999999916 | 0.118 | 0.725 | 1.113 |
| 0.519999999999916 | 0.12 | 0.726 | 1.113 |
| 0.524999999999916 | 0.122 | 0.726 | 1.114 |
| 0.529999999999916 | 0.124 | 0.727 | 1.114 |
| 0.534999999999916 | 0.126 | 0.728 | 1.114 |
| 0.539999999999916 | 0.128 | 0.728 | 1.115 |
| 0.544999999999916 | 0.13 | 0.729 | 1.115 |
| 0.549999999999916 | 0.132 | 0.73 | 1.115 |
| 0.554999999999916 | 0.134 | 0.73 | 1.115 |
| 0.559999999999916 | 0.136 | 0.731 | 1.116 |
| 0.564999999999916 | 0.139 | 0.732 | 1.116 |
| 0.569999999999916 | 0.141 | 0.732 | 1.116 |
| 0.574999999999916 | 0.143 | 0.733 | 1.117 |
| 0.579999999999916 | 0.145 | 0.734 | 1.117 |
| 0.584999999999916 | 0.147 | 0.734 | 1.117 |
| 0.589999999999916 | 0.149 | 0.735 | 1.118 |
| 0.594999999999916 | 0.152 | 0.736 | 1.118 |
| 0.599999999999916 | 0.154 | 0.736 | 1.118 |
| 0.604999999999916 | 0.156 | 0.737 | 1.119 |
| 0.609999999999916 | 0.158 | 0.738 | 1.119 |
| 0.614999999999916 | 0.16 | 0.738 | 1.119 |
| 0.619999999999916 | 0.163 | 0.739 | 1.12 |
| 0.624999999999916 | 0.165 | 0.74 | 1.12 |
| 0.629999999999916 | 0.167 | 0.74 | 1.12 |
| 0.634999999999916 | 0.169 | 0.741 | 1.121 |
| 0.639999999999916 | 0.172 | 0.742 | 1.121 |
| 0.644999999999916 | 0.174 | 0.743 | 1.121 |
| 0.649999999999916 | 0.176 | 0.743 | 1.122 |
| 0.654999999999916 | 0.178 | 0.744 | 1.122 |
| 0.659999999999916 | 0.181 | 0.745 | 1.122 |
| 0.664999999999916 | 0.183 | 0.746 | 1.123 |
| 0.669999999999916 | 0.185 | 0.746 | 1.123 |
| 0.674999999999916 | 0.188 | 0.747 | 1.123 |
| 0.679999999999916 | 0.19 | 0.748 | 1.124 |
| 0.684999999999916 | 0.192 | 0.749 | 1.124 |
| 0.689999999999916 | 0.195 | 0.749 | 1.124 |
| 0.694999999999916 | 0.197 | 0.75 | 1.125 |
| 0.699999999999916 | 0.199 | 0.751 | 1.125 |
| 0.704999999999916 | 0.202 | 0.752 | 1.125 |
| 0.709999999999916 | 0.204 | 0.752 | 1.126 |
| 0.714999999999916 | 0.206 | 0.753 | 1.126 |
| 0.719999999999916 | 0.209 | 0.754 | 1.127 |
| 0.724999999999916 | 0.211 | 0.755 | 1.127 |
| 0.729999999999916 | 0.214 | 0.756 | 1.127 |
| 0.734999999999916 | 0.216 | 0.756 | 1.128 |
| 0.739999999999916 | 0.218 | 0.757 | 1.128 |
| 0.744999999999916 | 0.221 | 0.758 | 1.129 |
| 0.749999999999916 | 0.223 | 0.759 | 1.129 |
| 0.754999999999916 | 0.226 | 0.76 | 1.129 |
| 0.759999999999916 | 0.228 | 0.761 | 1.13 |
| 0.764999999999916 | 0.23 | 0.761 | 1.13 |
| 0.769999999999916 | 0.233 | 0.762 | 1.131 |
| 0.774999999999916 | 0.235 | 0.763 | 1.131 |
| 0.779999999999916 | 0.238 | 0.764 | 1.131 |
| 0.784999999999916 | 0.24 | 0.765 | 1.132 |
| 0.789999999999916 | 0.242 | 0.766 | 1.132 |
| 0.794999999999916 | 0.245 | 0.766 | 1.133 |
| 0.799999999999916 | 0.247 | 0.767 | 1.133 |
| 0.804999999999916 | 0.25 | 0.768 | 1.133 |
| 0.809999999999916 | 0.252 | 0.769 | 1.134 |
| 0.814999999999916 | 0.255 | 0.77 | 1.134 |
| 0.819999999999916 | 0.257 | 0.771 | 1.135 |
| 0.824999999999916 | 0.26 | 0.772 | 1.135 |
| 0.829999999999916 | 0.262 | 0.773 | 1.135 |
| 0.834999999999916 | 0.264 | 0.773 | 1.136 |
| 0.839999999999916 | 0.267 | 0.774 | 1.136 |
| 0.844999999999916 | 0.269 | 0.775 | 1.137 |
| 0.849999999999916 | 0.272 | 0.776 | 1.137 |
| 0.854999999999916 | 0.274 | 0.777 | 1.138 |
| 0.859999999999916 | 0.277 | 0.778 | 1.138 |
| 0.864999999999916 | 0.279 | 0.779 | 1.139 |
| 0.869999999999916 | 0.282 | 0.78 | 1.139 |
| 0.874999999999916 | 0.284 | 0.781 | 1.139 |
| 0.879999999999916 | 0.287 | 0.782 | 1.14 |
| 0.884999999999916 | 0.289 | 0.783 | 1.14 |
| 0.889999999999916 | 0.292 | 0.783 | 1.141 |
| 0.894999999999916 | 0.294 | 0.784 | 1.141 |
| 0.899999999999916 | 0.297 | 0.785 | 1.142 |
| 0.904999999999916 | 0.299 | 0.786 | 1.142 |
| 0.909999999999916 | 0.302 | 0.787 | 1.143 |
| 0.914999999999916 | 0.304 | 0.788 | 1.143 |
| 0.919999999999916 | 0.307 | 0.789 | 1.144 |
| 0.924999999999916 | 0.309 | 0.79 | 1.144 |
| 0.929999999999916 | 0.312 | 0.791 | 1.144 |
| 0.934999999999916 | 0.314 | 0.792 | 1.145 |
| 0.939999999999916 | 0.317 | 0.793 | 1.145 |
| 0.944999999999916 | 0.319 | 0.794 | 1.146 |
| 0.949999999999916 | 0.322 | 0.795 | 1.146 |
| 0.954999999999916 | 0.324 | 0.796 | 1.147 |
| 0.959999999999916 | 0.327 | 0.797 | 1.147 |
| 0.964999999999916 | 0.329 | 0.798 | 1.148 |
| 0.969999999999916 | 0.332 | 0.799 | 1.148 |
| 0.974999999999916 | 0.334 | 0.8 | 1.149 |
| 0.979999999999916 | 0.337 | 0.801 | 1.149 |
| 0.984999999999916 | 0.339 | 0.802 | 1.15 |
| 0.989999999999916 | 0.342 | 0.803 | 1.15 |
| 0.994999999999916 | 0.344 | 0.804 | 1.151 |
| 0.999999999999916 | 0.347 | 0.805 | 1.151 |
| 1.004999999999916 | 0.349 | 0.806 | 1.152 |
| 1.009999999999916 | 0.352 | 0.807 | 1.152 |
| 1.014999999999916 | 0.354 | 0.808 | 1.153 |
| 1.019999999999916 | 0.357 | 0.809 | 1.153 |
| 1.024999999999916 | 0.359 | 0.81 | 1.154 |
| 1.029999999999916 | 0.362 | 0.811 | 1.154 |
| 1.034999999999916 | 0.364 | 0.812 | 1.155 |
| 1.039999999999915 | 0.367 | 0.813 | 1.155 |
| 1.044999999999915 | 0.369 | 0.814 | 1.156 |
| 1.049999999999915 | 0.372 | 0.815 | 1.156 |
| 1.054999999999915 | 0.374 | 0.816 | 1.157 |
| 1.059999999999915 | 0.377 | 0.817 | 1.157 |
| 1.064999999999915 | 0.379 | 0.818 | 1.158 |
| 1.069999999999915 | 0.382 | 0.819 | 1.158 |
| 1.074999999999915 | 0.384 | 0.82 | 1.159 |
| 1.079999999999915 | 0.387 | 0.821 | 1.16 |
| 1.084999999999914 | 0.389 | 0.822 | 1.16 |
| 1.089999999999914 | 0.392 | 0.823 | 1.161 |
| 1.094999999999914 | 0.394 | 0.824 | 1.161 |
| 1.099999999999914 | 0.396 | 0.825 | 1.162 |
| 1.104999999999914 | 0.399 | 0.826 | 1.162 |
| 1.109999999999914 | 0.401 | 0.827 | 1.163 |
| 1.114999999999914 | 0.404 | 0.828 | 1.163 |
| 1.119999999999914 | 0.406 | 0.83 | 1.164 |
| 1.124999999999914 | 0.409 | 0.831 | 1.164 |
| 1.129999999999914 | 0.411 | 0.832 | 1.165 |
| 1.134999999999913 | 0.414 | 0.833 | 1.166 |
| 1.139999999999913 | 0.416 | 0.834 | 1.166 |
| 1.144999999999913 | 0.419 | 0.835 | 1.167 |
| 1.149999999999913 | 0.421 | 0.836 | 1.167 |
| 1.154999999999913 | 0.424 | 0.837 | 1.168 |
| 1.159999999999913 | 0.426 | 0.838 | 1.168 |
| 1.164999999999913 | 0.429 | 0.839 | 1.169 |
| 1.169999999999913 | 0.431 | 0.84 | 1.169 |
| 1.174999999999913 | 0.434 | 0.841 | 1.17 |
| 1.179999999999912 | 0.436 | 0.842 | 1.171 |
| 1.184999999999912 | 0.439 | 0.844 | 1.171 |
| 1.189999999999912 | 0.441 | 0.845 | 1.172 |
| 1.194999999999912 | 0.444 | 0.846 | 1.172 |
| 1.199999999999912 | 0.446 | 0.847 | 1.173 |
| 1.204999999999912 | 0.448 | 0.848 | 1.173 |
| 1.209999999999912 | 0.451 | 0.849 | 1.174 |
| 1.214999999999912 | 0.453 | 0.85 | 1.175 |
| 1.219999999999912 | 0.456 | 0.851 | 1.175 |
| 1.224999999999911 | 0.458 | 0.852 | 1.176 |
| 1.229999999999911 | 0.461 | 0.854 | 1.176 |
| 1.234999999999911 | 0.463 | 0.855 | 1.177 |
| 1.239999999999911 | 0.466 | 0.856 | 1.177 |
| 1.244999999999911 | 0.468 | 0.857 | 1.178 |
| 1.249999999999911 | 0.47 | 0.858 | 1.179 |
| 1.254999999999911 | 0.473 | 0.859 | 1.179 |
| 1.259999999999911 | 0.475 | 0.86 | 1.18 |
| 1.264999999999911 | 0.478 | 0.861 | 1.18 |
| 1.269999999999911 | 0.48 | 0.863 | 1.181 |
| 1.27499999999991 | 0.483 | 0.864 | 1.182 |
| 1.27999999999991 | 0.485 | 0.865 | 1.182 |
| 1.28499999999991 | 0.488 | 0.866 | 1.183 |
| 1.28999999999991 | 0.49 | 0.867 | 1.183 |
| 1.29499999999991 | 0.492 | 0.868 | 1.184 |
| 1.29999999999991 | 0.495 | 0.869 | 1.185 |
| 1.30499999999991 | 0.497 | 0.87 | 1.185 |
| 1.30999999999991 | 0.5 | 0.872 | 1.186 |
| 1.31499999999991 | 0.502 | 0.873 | 1.186 |
| 1.319999999999909 | 0.504 | 0.874 | 1.187 |
| 1.324999999999909 | 0.507 | 0.875 | 1.188 |
| 1.329999999999909 | 0.509 | 0.876 | 1.188 |
| 1.334999999999909 | 0.512 | 0.877 | 1.189 |
| 1.339999999999909 | 0.514 | 0.879 | 1.19 |
| 1.344999999999909 | 0.516 | 0.88 | 1.19 |
| 1.349999999999909 | 0.519 | 0.881 | 1.191 |
| 1.354999999999909 | 0.521 | 0.882 | 1.191 |
| 1.359999999999909 | 0.524 | 0.883 | 1.192 |
| 1.364999999999908 | 0.526 | 0.884 | 1.193 |
| 1.369999999999908 | 0.528 | 0.886 | 1.193 |
| 1.374999999999908 | 0.531 | 0.887 | 1.194 |
| 1.379999999999908 | 0.533 | 0.888 | 1.195 |
| 1.384999999999908 | 0.535 | 0.889 | 1.195 |
| 1.389999999999908 | 0.538 | 0.89 | 1.196 |
| 1.394999999999908 | 0.54 | 0.891 | 1.196 |
| 1.399999999999908 | 0.543 | 0.893 | 1.197 |
| 1.404999999999908 | 0.545 | 0.894 | 1.198 |
| 1.409999999999908 | 0.547 | 0.895 | 1.198 |
| 1.414999999999907 | 0.55 | 0.896 | 1.199 |
| 1.419999999999907 | 0.552 | 0.897 | 1.2 |
| 1.424999999999907 | 0.554 | 0.898 | 1.2 |
| 1.429999999999907 | 0.557 | 0.9 | 1.201 |
| 1.434999999999907 | 0.559 | 0.901 | 1.202 |
| 1.439999999999907 | 0.561 | 0.902 | 1.202 |
| 1.444999999999907 | 0.564 | 0.903 | 1.203 |
| 1.449999999999907 | 0.566 | 0.904 | 1.204 |
| 1.454999999999907 | 0.568 | 0.906 | 1.204 |
| 1.459999999999906 | 0.571 | 0.907 | 1.205 |
| 1.464999999999906 | 0.573 | 0.908 | 1.206 |
| 1.469999999999906 | 0.575 | 0.909 | 1.206 |
| 1.474999999999906 | 0.578 | 0.91 | 1.207 |
| 1.479999999999906 | 0.58 | 0.911 | 1.208 |
| 1.484999999999906 | 0.582 | 0.913 | 1.208 |
| 1.489999999999906 | 0.585 | 0.914 | 1.209 |
| 1.494999999999906 | 0.587 | 0.915 | 1.21 |
| 1.499999999999906 | 0.589 | 0.916 | 1.21 |
| 1.504999999999906 | 0.592 | 0.917 | 1.211 |
| 1.509999999999905 | 0.594 | 0.919 | 1.212 |
| 1.514999999999905 | 0.596 | 0.92 | 1.212 |
| 1.519999999999905 | 0.599 | 0.921 | 1.213 |
| 1.524999999999905 | 0.601 | 0.922 | 1.214 |
| 1.529999999999905 | 0.603 | 0.924 | 1.214 |
| 1.534999999999905 | 0.605 | 0.925 | 1.215 |
| 1.539999999999905 | 0.608 | 0.926 | 1.216 |
| 1.544999999999905 | 0.61 | 0.927 | 1.216 |
| 1.549999999999905 | 0.612 | 0.928 | 1.217 |
| 1.554999999999904 | 0.615 | 0.93 | 1.218 |
| 1.559999999999904 | 0.617 | 0.931 | 1.218 |
| 1.564999999999904 | 0.619 | 0.932 | 1.219 |
| 1.569999999999904 | 0.621 | 0.933 | 1.22 |
| 1.574999999999904 | 0.624 | 0.934 | 1.22 |
| 1.579999999999904 | 0.626 | 0.936 | 1.221 |
| 1.584999999999904 | 0.628 | 0.937 | 1.222 |
| 1.589999999999904 | 0.63 | 0.938 | 1.222 |
| 1.594999999999904 | 0.633 | 0.939 | 1.223 |
| 1.599999999999903 | 0.635 | 0.94 | 1.224 |
| 1.604999999999903 | 0.637 | 0.942 | 1.224 |
| 1.609999999999903 | 0.639 | 0.943 | 1.225 |
| 1.614999999999903 | 0.642 | 0.944 | 1.226 |
| 1.619999999999903 | 0.644 | 0.945 | 1.227 |
| 1.624999999999903 | 0.646 | 0.947 | 1.227 |
| 1.629999999999903 | 0.648 | 0.948 | 1.228 |
| 1.634999999999903 | 0.651 | 0.949 | 1.229 |
| 1.639999999999903 | 0.653 | 0.95 | 1.229 |
| 1.644999999999902 | 0.655 | 0.952 | 1.23 |
| 1.649999999999902 | 0.657 | 0.953 | 1.231 |
| 1.654999999999902 | 0.659 | 0.954 | 1.231 |
| 1.659999999999902 | 0.662 | 0.955 | 1.232 |
| 1.664999999999902 | 0.664 | 0.956 | 1.233 |
| 1.669999999999902 | 0.666 | 0.958 | 1.234 |
| 1.674999999999902 | 0.668 | 0.959 | 1.234 |
| 1.679999999999902 | 0.67 | 0.96 | 1.235 |
| 1.684999999999902 | 0.673 | 0.961 | 1.236 |
| 1.689999999999901 | 0.675 | 0.963 | 1.236 |
| 1.694999999999901 | 0.677 | 0.964 | 1.237 |
| 1.699999999999901 | 0.679 | 0.965 | 1.238 |
| 1.704999999999901 | 0.681 | 0.966 | 1.239 |
| 1.709999999999901 | 0.684 | 0.968 | 1.239 |
| 1.714999999999901 | 0.686 | 0.969 | 1.24 |
| 1.719999999999901 | 0.688 | 0.97 | 1.241 |
| 1.724999999999901 | 0.69 | 0.971 | 1.241 |
| 1.729999999999901 | 0.692 | 0.972 | 1.242 |
| 1.734999999999901 | 0.694 | 0.974 | 1.243 |
| 1.7399999999999 | 0.697 | 0.975 | 1.244 |
| 1.7449999999999 | 0.699 | 0.976 | 1.244 |
| 1.7499999999999 | 0.701 | 0.977 | 1.245 |
| 1.7549999999999 | 0.703 | 0.979 | 1.246 |
| 1.7599999999999 | 0.705 | 0.98 | 1.247 |
| 1.7649999999999 | 0.707 | 0.981 | 1.247 |
| 1.7699999999999 | 0.709 | 0.982 | 1.248 |
| 1.7749999999999 | 0.712 | 0.984 | 1.249 |
| 1.7799999999999 | 0.714 | 0.985 | 1.249 |
| 1.784999999999899 | 0.716 | 0.986 | 1.25 |
| 1.789999999999899 | 0.718 | 0.987 | 1.251 |
| 1.794999999999899 | 0.72 | 0.989 | 1.252 |
| 1.799999999999899 | 0.722 | 0.99 | 1.252 |
| 1.804999999999899 | 0.724 | 0.991 | 1.253 |
| 1.809999999999899 | 0.727 | 0.992 | 1.254 |
| 1.814999999999899 | 0.729 | 0.994 | 1.255 |
| 1.819999999999899 | 0.731 | 0.995 | 1.255 |
| 1.824999999999899 | 0.733 | 0.996 | 1.256 |
| 1.829999999999899 | 0.735 | 0.997 | 1.257 |
| 1.834999999999898 | 0.737 | 0.999 | 1.258 |
| 1.839999999999898 | 0.739 | 1 | 1.258 |
| 1.844999999999898 | 0.741 | 1.001 | 1.259 |
| 1.849999999999898 | 0.743 | 1.002 | 1.26 |
| 1.854999999999898 | 0.745 | 1.004 | 1.26 |
| 1.859999999999898 | 0.748 | 1.005 | 1.261 |
| 1.864999999999898 | 0.75 | 1.006 | 1.262 |
| 1.869999999999898 | 0.752 | 1.007 | 1.263 |
| 1.874999999999898 | 0.754 | 1.008 | 1.263 |
| 1.879999999999897 | 0.756 | 1.01 | 1.264 |
| 1.884999999999897 | 0.758 | 1.011 | 1.265 |
| 1.889999999999897 | 0.76 | 1.012 | 1.266 |
| 1.894999999999897 | 0.762 | 1.013 | 1.266 |
| 1.899999999999897 | 0.764 | 1.015 | 1.267 |
| 1.904999999999897 | 0.766 | 1.016 | 1.268 |
| 1.909999999999897 | 0.768 | 1.017 | 1.269 |
| 1.914999999999897 | 0.77 | 1.018 | 1.27 |
| 1.919999999999897 | 0.772 | 1.02 | 1.27 |
| 1.924999999999897 | 0.774 | 1.021 | 1.271 |
| 1.929999999999896 | 0.776 | 1.022 | 1.272 |
| 1.934999999999896 | 0.778 | 1.023 | 1.273 |
| 1.939999999999896 | 0.781 | 1.025 | 1.273 |
| 1.944999999999896 | 0.783 | 1.026 | 1.274 |
| 1.949999999999896 | 0.785 | 1.027 | 1.275 |
| 1.954999999999896 | 0.787 | 1.028 | 1.276 |
| 1.959999999999896 | 0.789 | 1.03 | 1.276 |
| 1.964999999999896 | 0.791 | 1.031 | 1.277 |
| 1.969999999999896 | 0.793 | 1.032 | 1.278 |
| 1.974999999999895 | 0.795 | 1.033 | 1.279 |
| 1.979999999999895 | 0.797 | 1.035 | 1.279 |
| 1.984999999999895 | 0.799 | 1.036 | 1.28 |
| 1.989999999999895 | 0.801 | 1.037 | 1.281 |
| 1.994999999999895 | 0.803 | 1.038 | 1.282 |
| 1.999999999999895 | 0.805 | 1.04 | 1.282 |
| 2.004999999999895 | 0.807 | 1.041 | 1.283 |
| 2.009999999999895 | 0.809 | 1.042 | 1.284 |
| 2.014999999999895 | 0.811 | 1.043 | 1.285 |
| 2.019999999999895 | 0.813 | 1.045 | 1.286 |
| 2.024999999999895 | 0.815 | 1.046 | 1.286 |
| 2.029999999999895 | 0.817 | 1.047 | 1.287 |
| 2.034999999999894 | 0.819 | 1.048 | 1.288 |
| 2.039999999999894 | 0.821 | 1.05 | 1.289 |
| 2.044999999999894 | 0.823 | 1.051 | 1.289 |
| 2.049999999999894 | 0.825 | 1.052 | 1.29 |
| 2.054999999999894 | 0.827 | 1.053 | 1.291 |
| 2.059999999999894 | 0.829 | 1.055 | 1.292 |
| 2.064999999999894 | 0.83 | 1.056 | 1.293 |
| 2.069999999999894 | 0.832 | 1.057 | 1.293 |
| 2.074999999999894 | 0.834 | 1.058 | 1.294 |
| 2.079999999999893 | 0.836 | 1.06 | 1.295 |
| 2.084999999999893 | 0.838 | 1.061 | 1.296 |
| 2.089999999999893 | 0.84 | 1.062 | 1.296 |
| 2.094999999999893 | 0.842 | 1.063 | 1.297 |
| 2.099999999999893 | 0.844 | 1.065 | 1.298 |
| 2.104999999999893 | 0.846 | 1.066 | 1.299 |
| 2.109999999999893 | 0.848 | 1.067 | 1.3 |
| 2.114999999999893 | 0.85 | 1.068 | 1.3 |
| 2.119999999999893 | 0.852 | 1.07 | 1.301 |
| 2.124999999999893 | 0.854 | 1.071 | 1.302 |
| 2.129999999999892 | 0.856 | 1.072 | 1.303 |
| 2.134999999999892 | 0.858 | 1.073 | 1.303 |
| 2.139999999999892 | 0.86 | 1.075 | 1.304 |
| 2.144999999999892 | 0.861 | 1.076 | 1.305 |
| 2.149999999999892 | 0.863 | 1.077 | 1.306 |
| 2.154999999999892 | 0.865 | 1.078 | 1.307 |
| 2.159999999999892 | 0.867 | 1.08 | 1.307 |
| 2.164999999999892 | 0.869 | 1.081 | 1.308 |
| 2.169999999999892 | 0.871 | 1.082 | 1.309 |
| 2.174999999999891 | 0.873 | 1.083 | 1.31 |
| 2.179999999999891 | 0.875 | 1.085 | 1.311 |
| 2.184999999999891 | 0.877 | 1.086 | 1.311 |
| 2.189999999999891 | 0.879 | 1.087 | 1.312 |
| 2.194999999999891 | 0.88 | 1.088 | 1.313 |
| 2.199999999999891 | 0.882 | 1.09 | 1.314 |
| 2.204999999999891 | 0.884 | 1.091 | 1.315 |
| 2.209999999999891 | 0.886 | 1.092 | 1.315 |
| 2.214999999999891 | 0.888 | 1.093 | 1.316 |
| 2.21999999999989 | 0.89 | 1.095 | 1.317 |
| 2.22499999999989 | 0.892 | 1.096 | 1.318 |
| 2.22999999999989 | 0.894 | 1.097 | 1.319 |
| 2.23499999999989 | 0.895 | 1.098 | 1.319 |
| 2.23999999999989 | 0.897 | 1.1 | 1.32 |
| 2.24499999999989 | 0.899 | 1.101 | 1.321 |
| 2.24999999999989 | 0.901 | 1.102 | 1.322 |
| 2.25499999999989 | 0.903 | 1.103 | 1.323 |
| 2.25999999999989 | 0.905 | 1.105 | 1.323 |
| 2.26499999999989 | 0.907 | 1.106 | 1.324 |
| 2.269999999999889 | 0.908 | 1.107 | 1.325 |
| 2.274999999999889 | 0.91 | 1.108 | 1.326 |
| 2.279999999999889 | 0.912 | 1.11 | 1.327 |
| 2.284999999999889 | 0.914 | 1.111 | 1.327 |
| 2.289999999999889 | 0.916 | 1.112 | 1.328 |
| 2.294999999999889 | 0.918 | 1.113 | 1.329 |
| 2.299999999999889 | 0.919 | 1.114 | 1.33 |
| 2.304999999999889 | 0.921 | 1.116 | 1.331 |
| 2.309999999999889 | 0.923 | 1.117 | 1.331 |
| 2.314999999999888 | 0.925 | 1.118 | 1.332 |
| 2.319999999999888 | 0.927 | 1.119 | 1.333 |
| 2.324999999999888 | 0.929 | 1.121 | 1.334 |
| 2.329999999999888 | 0.93 | 1.122 | 1.335 |
| 2.334999999999888 | 0.932 | 1.123 | 1.335 |
| 2.339999999999888 | 0.934 | 1.124 | 1.336 |
| 2.344999999999888 | 0.936 | 1.126 | 1.337 |
| 2.349999999999888 | 0.938 | 1.127 | 1.338 |
| 2.354999999999888 | 0.939 | 1.128 | 1.339 |
| 2.359999999999887 | 0.941 | 1.129 | 1.339 |
| 2.364999999999887 | 0.943 | 1.131 | 1.34 |
| 2.369999999999887 | 0.945 | 1.132 | 1.341 |
| 2.374999999999887 | 0.947 | 1.133 | 1.342 |
| 2.379999999999887 | 0.948 | 1.134 | 1.343 |
| 2.384999999999887 | 0.95 | 1.135 | 1.344 |
| 2.389999999999887 | 0.952 | 1.137 | 1.344 |
| 2.394999999999887 | 0.954 | 1.138 | 1.345 |
| 2.399999999999887 | 0.956 | 1.139 | 1.346 |
| 2.404999999999887 | 0.957 | 1.14 | 1.347 |
| 2.409999999999886 | 0.959 | 1.142 | 1.348 |
| 2.414999999999886 | 0.961 | 1.143 | 1.348 |
| 2.419999999999886 | 0.963 | 1.144 | 1.349 |
| 2.424999999999886 | 0.964 | 1.145 | 1.35 |
| 2.429999999999886 | 0.966 | 1.147 | 1.351 |
| 2.434999999999886 | 0.968 | 1.148 | 1.352 |
| 2.439999999999886 | 0.97 | 1.149 | 1.352 |
| 2.444999999999886 | 0.971 | 1.15 | 1.353 |
| 2.449999999999886 | 0.973 | 1.151 | 1.354 |
| 2.454999999999885 | 0.975 | 1.153 | 1.355 |
| 2.459999999999885 | 0.977 | 1.154 | 1.356 |
| 2.464999999999885 | 0.978 | 1.155 | 1.357 |
| 2.469999999999885 | 0.98 | 1.156 | 1.357 |
| 2.474999999999885 | 0.982 | 1.158 | 1.358 |
| 2.479999999999885 | 0.984 | 1.159 | 1.359 |
| 2.484999999999885 | 0.985 | 1.16 | 1.36 |
| 2.489999999999885 | 0.987 | 1.161 | 1.361 |
| 2.494999999999885 | 0.989 | 1.162 | 1.361 |
| 2.499999999999884 | 0.991 | 1.164 | 1.362 |
| 2.504999999999884 | 0.992 | 1.165 | 1.363 |
| 2.509999999999884 | 0.994 | 1.166 | 1.364 |
| 2.514999999999884 | 0.996 | 1.167 | 1.365 |
| 2.519999999999884 | 0.997 | 1.169 | 1.366 |
| 2.524999999999884 | 0.999 | 1.17 | 1.366 |
| 2.529999999999884 | 1.001 | 1.171 | 1.367 |
| 2.534999999999884 | 1.003 | 1.172 | 1.368 |
| 2.539999999999884 | 1.004 | 1.173 | 1.369 |
| 2.544999999999884 | 1.006 | 1.175 | 1.37 |
| 2.549999999999883 | 1.008 | 1.176 | 1.371 |
| 2.554999999999883 | 1.009 | 1.177 | 1.371 |
| 2.559999999999883 | 1.011 | 1.178 | 1.372 |
| 2.564999999999883 | 1.013 | 1.179 | 1.373 |
| 2.569999999999883 | 1.014 | 1.181 | 1.374 |
| 2.574999999999883 | 1.016 | 1.182 | 1.375 |
| 2.579999999999883 | 1.018 | 1.183 | 1.375 |
| 2.584999999999883 | 1.019 | 1.184 | 1.376 |
| 2.589999999999883 | 1.021 | 1.186 | 1.377 |
| 2.594999999999882 | 1.023 | 1.187 | 1.378 |
| 2.599999999999882 | 1.024 | 1.188 | 1.379 |
| 2.604999999999882 | 1.026 | 1.189 | 1.38 |
| 2.609999999999882 | 1.028 | 1.19 | 1.38 |
| 2.614999999999882 | 1.03 | 1.192 | 1.381 |
| 2.619999999999882 | 1.031 | 1.193 | 1.382 |
| 2.624999999999882 | 1.033 | 1.194 | 1.383 |
| 2.629999999999882 | 1.034 | 1.195 | 1.384 |
| 2.634999999999882 | 1.036 | 1.196 | 1.385 |
| 2.639999999999881 | 1.038 | 1.198 | 1.385 |
| 2.644999999999881 | 1.039 | 1.199 | 1.386 |
| 2.649999999999881 | 1.041 | 1.2 | 1.387 |
| 2.654999999999881 | 1.043 | 1.201 | 1.388 |
| 2.659999999999881 | 1.044 | 1.202 | 1.389 |
| 2.664999999999881 | 1.046 | 1.204 | 1.389 |
| 2.669999999999881 | 1.048 | 1.205 | 1.39 |
| 2.674999999999881 | 1.049 | 1.206 | 1.391 |
| 2.679999999999881 | 1.051 | 1.207 | 1.392 |
| 2.68499999999988 | 1.053 | 1.208 | 1.393 |
| 2.68999999999988 | 1.054 | 1.21 | 1.394 |
| 2.69499999999988 | 1.056 | 1.211 | 1.394 |
| 2.69999999999988 | 1.058 | 1.212 | 1.395 |
| 2.70499999999988 | 1.059 | 1.213 | 1.396 |
| 2.70999999999988 | 1.061 | 1.214 | 1.397 |
| 2.71499999999988 | 1.062 | 1.216 | 1.398 |
| 2.71999999999988 | 1.064 | 1.217 | 1.399 |
| 2.72499999999988 | 1.066 | 1.218 | 1.399 |
| 2.72999999999988 | 1.067 | 1.219 | 1.4 |
| 2.734999999999879 | 1.069 | 1.22 | 1.401 |
| 2.739999999999879 | 1.07 | 1.222 | 1.402 |
| 2.744999999999879 | 1.072 | 1.223 | 1.403 |
| 2.749999999999879 | 1.074 | 1.224 | 1.404 |
| 2.754999999999879 | 1.075 | 1.225 | 1.404 |
| 2.759999999999879 | 1.077 | 1.226 | 1.405 |
| 2.764999999999879 | 1.079 | 1.227 | 1.406 |
| 2.769999999999879 | 1.08 | 1.229 | 1.407 |
| 2.774999999999879 | 1.082 | 1.23 | 1.408 |
| 2.779999999999878 | 1.083 | 1.231 | 1.409 |
| 2.784999999999878 | 1.085 | 1.232 | 1.409 |
| 2.789999999999878 | 1.086 | 1.233 | 1.41 |
| 2.794999999999878 | 1.088 | 1.235 | 1.411 |
| 2.799999999999878 | 1.09 | 1.236 | 1.412 |
| 2.804999999999878 | 1.091 | 1.237 | 1.413 |
| 2.809999999999878 | 1.093 | 1.238 | 1.414 |
| 2.814999999999878 | 1.094 | 1.239 | 1.414 |
| 2.819999999999878 | 1.096 | 1.24 | 1.415 |
| 2.824999999999878 | 1.098 | 1.242 | 1.416 |
| 2.829999999999877 | 1.099 | 1.243 | 1.417 |
| 2.834999999999877 | 1.101 | 1.244 | 1.418 |
| 2.839999999999877 | 1.102 | 1.245 | 1.419 |
| 2.844999999999877 | 1.104 | 1.246 | 1.419 |
| 2.849999999999877 | 1.105 | 1.248 | 1.42 |
| 2.854999999999877 | 1.107 | 1.249 | 1.421 |
| 2.859999999999877 | 1.108 | 1.25 | 1.422 |
| 2.864999999999877 | 1.11 | 1.251 | 1.423 |
| 2.869999999999877 | 1.112 | 1.252 | 1.424 |
| 2.874999999999876 | 1.113 | 1.253 | 1.424 |
| 2.879999999999876 | 1.115 | 1.255 | 1.425 |
| 2.884999999999876 | 1.116 | 1.256 | 1.426 |
| 2.889999999999876 | 1.118 | 1.257 | 1.427 |
| 2.894999999999876 | 1.119 | 1.258 | 1.428 |
| 2.899999999999876 | 1.121 | 1.259 | 1.429 |
| 2.904999999999876 | 1.122 | 1.26 | 1.429 |
| 2.909999999999876 | 1.124 | 1.262 | 1.43 |
| 2.914999999999876 | 1.125 | 1.263 | 1.431 |
| 2.919999999999876 | 1.127 | 1.264 | 1.432 |
| 2.924999999999875 | 1.129 | 1.265 | 1.433 |
| 2.929999999999875 | 1.13 | 1.266 | 1.434 |
| 2.934999999999875 | 1.132 | 1.267 | 1.434 |
| 2.939999999999875 | 1.133 | 1.269 | 1.435 |
| 2.944999999999875 | 1.135 | 1.27 | 1.436 |
| 2.949999999999875 | 1.136 | 1.271 | 1.437 |
| 2.954999999999875 | 1.138 | 1.272 | 1.438 |
| 2.959999999999875 | 1.139 | 1.273 | 1.439 |
| 2.964999999999875 | 1.141 | 1.274 | 1.439 |
| 2.969999999999874 | 1.142 | 1.276 | 1.44 |
| 2.974999999999874 | 1.144 | 1.277 | 1.441 |
| 2.979999999999874 | 1.145 | 1.278 | 1.442 |
| 2.984999999999874 | 1.147 | 1.279 | 1.443 |
| 2.989999999999874 | 1.148 | 1.28 | 1.444 |
| 2.994999999999874 | 1.15 | 1.281 | 1.444 |
| 2.999999999999874 | 1.151 | 1.282 | 1.445 |
| 3.004999999999874 | 1.153 | 1.284 | 1.446 |
| 3.009999999999874 | 1.154 | 1.285 | 1.447 |
| 3.014999999999874 | 1.156 | 1.286 | 1.448 |
| 3.019999999999873 | 1.157 | 1.287 | 1.449 |
| 3.024999999999873 | 1.159 | 1.288 | 1.449 |
| 3.029999999999873 | 1.16 | 1.289 | 1.45 |
| 3.034999999999873 | 1.162 | 1.291 | 1.451 |
| 3.039999999999873 | 1.163 | 1.292 | 1.452 |
| 3.044999999999873 | 1.165 | 1.293 | 1.453 |
| 3.049999999999873 | 1.166 | 1.294 | 1.454 |
| 3.054999999999873 | 1.168 | 1.295 | 1.454 |
| 3.059999999999873 | 1.169 | 1.296 | 1.455 |
| 3.064999999999872 | 1.171 | 1.297 | 1.456 |
| 3.069999999999872 | 1.172 | 1.299 | 1.457 |
| 3.074999999999872 | 1.174 | 1.3 | 1.458 |
| 3.079999999999872 | 1.175 | 1.301 | 1.459 |
| 3.084999999999872 | 1.177 | 1.302 | 1.459 |
| 3.089999999999872 | 1.178 | 1.303 | 1.46 |
| 3.094999999999872 | 1.179 | 1.304 | 1.461 |
| 3.099999999999872 | 1.181 | 1.305 | 1.462 |
| 3.104999999999872 | 1.182 | 1.307 | 1.463 |
| 3.109999999999872 | 1.184 | 1.308 | 1.464 |
| 3.114999999999871 | 1.185 | 1.309 | 1.464 |
| 3.119999999999871 | 1.187 | 1.31 | 1.465 |
| 3.124999999999871 | 1.188 | 1.311 | 1.466 |
| 3.129999999999871 | 1.19 | 1.312 | 1.467 |
| 3.134999999999871 | 1.191 | 1.313 | 1.468 |
| 3.139999999999871 | 1.193 | 1.314 | 1.469 |
| 3.144999999999871 | 1.194 | 1.316 | 1.469 |
| 3.149999999999871 | 1.195 | 1.317 | 1.47 |
| 3.154999999999871 | 1.197 | 1.318 | 1.471 |
| 3.15999999999987 | 1.198 | 1.319 | 1.472 |
| 3.16499999999987 | 1.2 | 1.32 | 1.473 |
| 3.16999999999987 | 1.201 | 1.321 | 1.474 |
| 3.17499999999987 | 1.203 | 1.322 | 1.474 |
| 3.17999999999987 | 1.204 | 1.324 | 1.475 |
| 3.18499999999987 | 1.205 | 1.325 | 1.476 |
| 3.18999999999987 | 1.207 | 1.326 | 1.477 |
| 3.19499999999987 | 1.208 | 1.327 | 1.478 |
| 3.19999999999987 | 1.21 | 1.328 | 1.478 |
| 3.204999999999869 | 1.211 | 1.329 | 1.479 |
| 3.209999999999869 | 1.213 | 1.33 | 1.48 |
| 3.214999999999869 | 1.214 | 1.331 | 1.481 |
| 3.219999999999869 | 1.215 | 1.333 | 1.482 |
| 3.224999999999869 | 1.217 | 1.334 | 1.483 |
| 3.229999999999869 | 1.218 | 1.335 | 1.483 |
| 3.234999999999869 | 1.22 | 1.336 | 1.484 |
| 3.239999999999869 | 1.221 | 1.337 | 1.485 |
| 3.244999999999869 | 1.222 | 1.338 | 1.486 |
| 3.249999999999869 | 1.224 | 1.339 | 1.487 |
| 3.254999999999868 | 1.225 | 1.34 | 1.488 |
| 3.259999999999868 | 1.227 | 1.341 | 1.488 |
| 3.264999999999868 | 1.228 | 1.343 | 1.489 |
| 3.269999999999868 | 1.229 | 1.344 | 1.49 |
| 3.274999999999868 | 1.231 | 1.345 | 1.491 |
| 3.279999999999868 | 1.232 | 1.346 | 1.492 |
| 3.284999999999868 | 1.234 | 1.347 | 1.493 |
| 3.289999999999868 | 1.235 | 1.348 | 1.493 |
| 3.294999999999868 | 1.236 | 1.349 | 1.494 |
| 3.299999999999867 | 1.238 | 1.35 | 1.495 |
| 3.304999999999867 | 1.239 | 1.351 | 1.496 |
| 3.309999999999867 | 1.241 | 1.353 | 1.497 |
| 3.314999999999867 | 1.242 | 1.354 | 1.498 |
| 3.319999999999867 | 1.243 | 1.355 | 1.498 |
| 3.324999999999867 | 1.245 | 1.356 | 1.499 |
| 3.329999999999867 | 1.246 | 1.357 | 1.5 |
| 3.334999999999867 | 1.248 | 1.358 | 1.501 |
| 3.339999999999867 | 1.249 | 1.359 | 1.502 |
| 3.344999999999866 | 1.25 | 1.36 | 1.503 |
| 3.349999999999866 | 1.252 | 1.361 | 1.503 |
| 3.354999999999866 | 1.253 | 1.362 | 1.504 |
| 3.359999999999866 | 1.254 | 1.364 | 1.505 |
| 3.364999999999866 | 1.256 | 1.365 | 1.506 |
| 3.369999999999866 | 1.257 | 1.366 | 1.507 |
| 3.374999999999866 | 1.258 | 1.367 | 1.508 |
| 3.379999999999866 | 1.26 | 1.368 | 1.508 |
| 3.384999999999866 | 1.261 | 1.369 | 1.509 |
| 3.389999999999866 | 1.263 | 1.37 | 1.51 |
| 3.394999999999865 | 1.264 | 1.371 | 1.511 |
| 3.399999999999865 | 1.265 | 1.372 | 1.512 |
| 3.404999999999865 | 1.267 | 1.373 | 1.513 |
| 3.409999999999865 | 1.268 | 1.375 | 1.513 |
| 3.414999999999865 | 1.269 | 1.376 | 1.514 |
| 3.419999999999865 | 1.271 | 1.377 | 1.515 |
| 3.424999999999865 | 1.272 | 1.378 | 1.516 |
| 3.429999999999865 | 1.273 | 1.379 | 1.517 |
| 3.434999999999865 | 1.275 | 1.38 | 1.517 |
| 3.439999999999864 | 1.276 | 1.381 | 1.518 |
| 3.444999999999864 | 1.277 | 1.382 | 1.519 |
| 3.449999999999864 | 1.279 | 1.383 | 1.52 |
| 3.454999999999864 | 1.28 | 1.384 | 1.521 |
| 3.459999999999864 | 1.281 | 1.385 | 1.522 |
| 3.464999999999864 | 1.283 | 1.386 | 1.522 |
| 3.469999999999864 | 1.284 | 1.388 | 1.523 |
| 3.474999999999864 | 1.285 | 1.389 | 1.524 |
| 3.479999999999864 | 1.287 | 1.39 | 1.525 |
| 3.484999999999864 | 1.288 | 1.391 | 1.526 |
| 3.489999999999863 | 1.289 | 1.392 | 1.527 |
| 3.494999999999863 | 1.291 | 1.393 | 1.527 |
| 3.499999999999863 | 1.292 | 1.394 | 1.528 |
| 3.504999999999863 | 1.293 | 1.395 | 1.529 |
| 3.509999999999863 | 1.295 | 1.396 | 1.53 |
| 3.514999999999863 | 1.296 | 1.397 | 1.531 |
| 3.519999999999863 | 1.297 | 1.398 | 1.531 |
| 3.524999999999863 | 1.299 | 1.399 | 1.532 |
| 3.529999999999863 | 1.3 | 1.4 | 1.533 |
| 3.534999999999862 | 1.301 | 1.402 | 1.534 |
| 3.539999999999862 | 1.303 | 1.403 | 1.535 |
| 3.544999999999862 | 1.304 | 1.404 | 1.536 |
| 3.549999999999862 | 1.305 | 1.405 | 1.536 |
| 3.554999999999862 | 1.306 | 1.406 | 1.537 |
| 3.559999999999862 | 1.308 | 1.407 | 1.538 |
| 3.564999999999862 | 1.309 | 1.408 | 1.539 |
| 3.569999999999862 | 1.31 | 1.409 | 1.54 |
| 3.574999999999862 | 1.312 | 1.41 | 1.541 |
| 3.579999999999862 | 1.313 | 1.411 | 1.541 |
| 3.584999999999861 | 1.314 | 1.412 | 1.542 |
| 3.589999999999861 | 1.316 | 1.413 | 1.543 |
| 3.594999999999861 | 1.317 | 1.414 | 1.544 |
| 3.599999999999861 | 1.318 | 1.415 | 1.545 |
| 3.604999999999861 | 1.319 | 1.416 | 1.545 |
| 3.609999999999861 | 1.321 | 1.418 | 1.546 |
| 3.614999999999861 | 1.322 | 1.419 | 1.547 |
| 3.619999999999861 | 1.323 | 1.42 | 1.548 |
| 3.62499999999986 | 1.325 | 1.421 | 1.549 |
| 3.62999999999986 | 1.326 | 1.422 | 1.55 |
| 3.63499999999986 | 1.327 | 1.423 | 1.55 |
| 3.63999999999986 | 1.328 | 1.424 | 1.551 |
| 3.64499999999986 | 1.33 | 1.425 | 1.552 |
| 3.64999999999986 | 1.331 | 1.426 | 1.553 |
| 3.65499999999986 | 1.332 | 1.427 | 1.554 |
| 3.65999999999986 | 1.333 | 1.428 | 1.554 |
| 3.66499999999986 | 1.335 | 1.429 | 1.555 |
| 3.669999999999859 | 1.336 | 1.43 | 1.556 |
| 3.674999999999859 | 1.337 | 1.431 | 1.557 |
| 3.679999999999859 | 1.339 | 1.432 | 1.558 |
| 3.684999999999859 | 1.34 | 1.433 | 1.559 |
| 3.689999999999859 | 1.341 | 1.434 | 1.559 |
| 3.694999999999859 | 1.342 | 1.435 | 1.56 |
| 3.699999999999859 | 1.344 | 1.436 | 1.561 |
| 3.704999999999859 | 1.345 | 1.438 | 1.562 |
| 3.709999999999859 | 1.346 | 1.439 | 1.563 |
| 3.714999999999859 | 1.347 | 1.44 | 1.563 |
| 3.719999999999858 | 1.349 | 1.441 | 1.564 |
| 3.724999999999858 | 1.35 | 1.442 | 1.565 |
| 3.729999999999858 | 1.351 | 1.443 | 1.566 |
| 3.734999999999858 | 1.352 | 1.444 | 1.567 |
| 3.739999999999858 | 1.354 | 1.445 | 1.567 |
| 3.744999999999858 | 1.355 | 1.446 | 1.568 |
| 3.749999999999858 | 1.356 | 1.447 | 1.569 |
| 3.754999999999858 | 1.357 | 1.448 | 1.57 |
| 3.759999999999858 | 1.359 | 1.449 | 1.571 |
| 3.764999999999857 | 1.36 | 1.45 | 1.572 |
| 3.769999999999857 | 1.361 | 1.451 | 1.572 |
| 3.774999999999857 | 1.362 | 1.452 | 1.573 |
| 3.779999999999857 | 1.364 | 1.453 | 1.574 |
| 3.784999999999857 | 1.365 | 1.454 | 1.575 |
| 3.789999999999857 | 1.366 | 1.455 | 1.576 |
| 3.794999999999857 | 1.367 | 1.456 | 1.576 |
| 3.799999999999857 | 1.368 | 1.457 | 1.577 |
| 3.804999999999857 | 1.37 | 1.458 | 1.578 |
| 3.809999999999857 | 1.371 | 1.459 | 1.579 |
| 3.814999999999856 | 1.372 | 1.46 | 1.58 |
| 3.819999999999856 | 1.373 | 1.461 | 1.58 |
| 3.824999999999856 | 1.375 | 1.462 | 1.581 |
| 3.829999999999856 | 1.376 | 1.463 | 1.582 |
| 3.834999999999856 | 1.377 | 1.464 | 1.583 |
| 3.839999999999856 | 1.378 | 1.465 | 1.584 |
| 3.844999999999856 | 1.379 | 1.467 | 1.585 |
| 3.849999999999856 | 1.381 | 1.468 | 1.585 |
| 3.854999999999856 | 1.382 | 1.469 | 1.586 |
| 3.859999999999855 | 1.383 | 1.47 | 1.587 |
| 3.864999999999855 | 1.384 | 1.471 | 1.588 |
| 3.869999999999855 | 1.386 | 1.472 | 1.589 |
| 3.874999999999855 | 1.387 | 1.473 | 1.589 |
| 3.879999999999855 | 1.388 | 1.474 | 1.59 |
| 3.884999999999855 | 1.389 | 1.475 | 1.591 |
| 3.889999999999855 | 1.39 | 1.476 | 1.592 |
| 3.894999999999855 | 1.392 | 1.477 | 1.593 |
| 3.899999999999855 | 1.393 | 1.478 | 1.593 |
| 3.904999999999855 | 1.394 | 1.479 | 1.594 |
| 3.909999999999854 | 1.395 | 1.48 | 1.595 |
| 3.914999999999854 | 1.396 | 1.481 | 1.596 |
| 3.919999999999854 | 1.398 | 1.482 | 1.597 |
| 3.924999999999854 | 1.399 | 1.483 | 1.597 |
| 3.929999999999854 | 1.4 | 1.484 | 1.598 |
| 3.934999999999854 | 1.401 | 1.485 | 1.599 |
| 3.939999999999854 | 1.402 | 1.486 | 1.6 |
| 3.944999999999854 | 1.404 | 1.487 | 1.601 |
| 3.949999999999854 | 1.405 | 1.488 | 1.601 |
| 3.954999999999853 | 1.406 | 1.489 | 1.602 |
| 3.959999999999853 | 1.407 | 1.49 | 1.603 |
| 3.964999999999853 | 1.408 | 1.491 | 1.604 |
| 3.969999999999853 | 1.41 | 1.492 | 1.605 |
| 3.974999999999853 | 1.411 | 1.493 | 1.605 |
| 3.979999999999853 | 1.412 | 1.494 | 1.606 |
| 3.984999999999853 | 1.413 | 1.495 | 1.607 |
| 3.989999999999853 | 1.414 | 1.496 | 1.608 |
| 3.994999999999853 | 1.415 | 1.497 | 1.609 |
| 3.999999999999853 | 1.417 | 1.498 | 1.609 |
| 4.004999999999852 | 1.418 | 1.499 | 1.61 |
| 4.009999999999852 | 1.419 | 1.5 | 1.611 |
| 4.014999999999852 | 1.42 | 1.501 | 1.612 |
| 4.019999999999852 | 1.421 | 1.502 | 1.613 |
| 4.024999999999852 | 1.422 | 1.503 | 1.613 |
| 4.029999999999852 | 1.424 | 1.504 | 1.614 |
| 4.034999999999852 | 1.425 | 1.505 | 1.615 |
| 4.039999999999851 | 1.426 | 1.506 | 1.616 |
| 4.044999999999852 | 1.427 | 1.507 | 1.617 |
| 4.049999999999851 | 1.428 | 1.508 | 1.617 |
| 4.054999999999851 | 1.429 | 1.509 | 1.618 |
| 4.059999999999851 | 1.431 | 1.51 | 1.619 |
| 4.064999999999851 | 1.432 | 1.511 | 1.62 |
| 4.069999999999851 | 1.433 | 1.512 | 1.621 |
| 4.074999999999851 | 1.434 | 1.513 | 1.621 |
| 4.07999999999985 | 1.435 | 1.514 | 1.622 |
| 4.084999999999851 | 1.436 | 1.515 | 1.623 |
| 4.08999999999985 | 1.438 | 1.516 | 1.624 |
| 4.094999999999851 | 1.439 | 1.517 | 1.625 |
| 4.09999999999985 | 1.44 | 1.518 | 1.625 |
| 4.10499999999985 | 1.441 | 1.519 | 1.626 |
| 4.10999999999985 | 1.442 | 1.52 | 1.627 |
| 4.11499999999985 | 1.443 | 1.521 | 1.628 |
| 4.11999999999985 | 1.444 | 1.522 | 1.629 |
| 4.12499999999985 | 1.446 | 1.523 | 1.629 |
| 4.12999999999985 | 1.447 | 1.524 | 1.63 |
| 4.13499999999985 | 1.448 | 1.525 | 1.631 |
| 4.13999999999985 | 1.449 | 1.526 | 1.632 |
| 4.144999999999849 | 1.45 | 1.527 | 1.633 |
| 4.14999999999985 | 1.451 | 1.528 | 1.633 |
| 4.154999999999849 | 1.452 | 1.529 | 1.634 |
| 4.15999999999985 | 1.454 | 1.529 | 1.635 |
| 4.164999999999849 | 1.455 | 1.53 | 1.636 |
| 4.169999999999849 | 1.456 | 1.531 | 1.636 |
| 4.174999999999849 | 1.457 | 1.532 | 1.637 |
| 4.179999999999848 | 1.458 | 1.533 | 1.638 |
| 4.184999999999849 | 1.459 | 1.534 | 1.639 |
| 4.189999999999848 | 1.46 | 1.535 | 1.64 |
| 4.194999999999848 | 1.462 | 1.536 | 1.64 |
| 4.199999999999848 | 1.463 | 1.537 | 1.641 |
| 4.204999999999848 | 1.464 | 1.538 | 1.642 |
| 4.209999999999848 | 1.465 | 1.539 | 1.643 |
| 4.214999999999848 | 1.466 | 1.54 | 1.644 |
| 4.219999999999847 | 1.467 | 1.541 | 1.644 |
| 4.224999999999848 | 1.468 | 1.542 | 1.645 |
| 4.229999999999847 | 1.469 | 1.543 | 1.646 |
| 4.234999999999847 | 1.471 | 1.544 | 1.647 |
| 4.239999999999847 | 1.472 | 1.545 | 1.648 |
| 4.244999999999847 | 1.473 | 1.546 | 1.648 |
| 4.249999999999847 | 1.474 | 1.547 | 1.649 |
| 4.254999999999847 | 1.475 | 1.548 | 1.65 |
| 4.259999999999846 | 1.476 | 1.549 | 1.651 |
| 4.264999999999847 | 1.477 | 1.55 | 1.651 |
| 4.269999999999846 | 1.478 | 1.551 | 1.652 |
| 4.274999999999846 | 1.479 | 1.552 | 1.653 |
| 4.279999999999846 | 1.481 | 1.553 | 1.654 |
| 4.284999999999846 | 1.482 | 1.554 | 1.655 |
| 4.289999999999846 | 1.483 | 1.555 | 1.655 |
| 4.294999999999846 | 1.484 | 1.556 | 1.656 |
| 4.299999999999846 | 1.485 | 1.557 | 1.657 |
| 4.304999999999846 | 1.486 | 1.557 | 1.658 |
| 4.309999999999845 | 1.487 | 1.558 | 1.658 |
| 4.314999999999846 | 1.488 | 1.559 | 1.659 |
| 4.319999999999845 | 1.489 | 1.56 | 1.66 |
| 4.324999999999846 | 1.49 | 1.561 | 1.661 |
| 4.329999999999845 | 1.492 | 1.562 | 1.662 |
| 4.334999999999845 | 1.493 | 1.563 | 1.662 |
| 4.339999999999845 | 1.494 | 1.564 | 1.663 |
| 4.344999999999845 | 1.495 | 1.565 | 1.664 |
| 4.349999999999845 | 1.496 | 1.566 | 1.665 |
| 4.354999999999845 | 1.497 | 1.567 | 1.665 |
| 4.359999999999844 | 1.498 | 1.568 | 1.666 |
| 4.364999999999845 | 1.499 | 1.569 | 1.667 |
| 4.369999999999844 | 1.5 | 1.57 | 1.668 |
| 4.374999999999844 | 1.501 | 1.571 | 1.669 |
| 4.379999999999844 | 1.502 | 1.572 | 1.669 |
| 4.384999999999844 | 1.504 | 1.573 | 1.67 |
| 4.389999999999844 | 1.505 | 1.574 | 1.671 |
| 4.394999999999844 | 1.506 | 1.575 | 1.672 |
| 4.399999999999844 | 1.507 | 1.576 | 1.672 |
| 4.404999999999844 | 1.508 | 1.576 | 1.673 |
| 4.409999999999843 | 1.509 | 1.577 | 1.674 |
| 4.414999999999844 | 1.51 | 1.578 | 1.675 |
| 4.419999999999843 | 1.511 | 1.579 | 1.676 |
| 4.424999999999843 | 1.512 | 1.58 | 1.676 |
| 4.429999999999843 | 1.513 | 1.581 | 1.677 |
| 4.434999999999843 | 1.514 | 1.582 | 1.678 |
| 4.439999999999843 | 1.515 | 1.583 | 1.679 |
| 4.444999999999843 | 1.516 | 1.584 | 1.679 |
| 4.449999999999842 | 1.518 | 1.585 | 1.68 |
| 4.454999999999843 | 1.519 | 1.586 | 1.681 |
| 4.459999999999842 | 1.52 | 1.587 | 1.682 |
| 4.464999999999843 | 1.521 | 1.588 | 1.683 |
| 4.469999999999842 | 1.522 | 1.589 | 1.683 |
| 4.474999999999842 | 1.523 | 1.59 | 1.684 |
| 4.479999999999842 | 1.524 | 1.59 | 1.685 |
| 4.484999999999842 | 1.525 | 1.591 | 1.686 |
| 4.489999999999842 | 1.526 | 1.592 | 1.686 |
| 4.494999999999842 | 1.527 | 1.593 | 1.687 |
| 4.499999999999841 | 1.528 | 1.594 | 1.688 |
| 4.504999999999842 | 1.529 | 1.595 | 1.689 |
| 4.509999999999841 | 1.53 | 1.596 | 1.689 |
| 4.514999999999842 | 1.531 | 1.597 | 1.69 |
| 4.519999999999841 | 1.532 | 1.598 | 1.691 |
| 4.524999999999841 | 1.533 | 1.599 | 1.692 |
| 4.529999999999841 | 1.535 | 1.6 | 1.693 |
| 4.534999999999841 | 1.536 | 1.601 | 1.693 |
| 4.53999999999984 | 1.537 | 1.602 | 1.694 |
| 4.544999999999841 | 1.538 | 1.603 | 1.695 |
| 4.54999999999984 | 1.539 | 1.603 | 1.696 |
| 4.554999999999841 | 1.54 | 1.604 | 1.696 |
| 4.55999999999984 | 1.541 | 1.605 | 1.697 |
| 4.564999999999841 | 1.542 | 1.606 | 1.698 |
| 4.56999999999984 | 1.543 | 1.607 | 1.699 |
| 4.57499999999984 | 1.544 | 1.608 | 1.699 |
| 4.57999999999984 | 1.545 | 1.609 | 1.7 |
| 4.58499999999984 | 1.546 | 1.61 | 1.701 |
| 4.58999999999984 | 1.547 | 1.611 | 1.702 |
| 4.59499999999984 | 1.548 | 1.612 | 1.702 |
| 4.59999999999984 | 1.549 | 1.613 | 1.703 |
| 4.60499999999984 | 1.55 | 1.614 | 1.704 |
| 4.60999999999984 | 1.551 | 1.614 | 1.705 |
| 4.614999999999839 | 1.552 | 1.615 | 1.706 |
| 4.61999999999984 | 1.553 | 1.616 | 1.706 |
| 4.624999999999839 | 1.554 | 1.617 | 1.707 |
| 4.62999999999984 | 1.555 | 1.618 | 1.708 |
| 4.634999999999839 | 1.556 | 1.619 | 1.709 |
| 4.639999999999838 | 1.557 | 1.62 | 1.709 |
| 4.644999999999839 | 1.558 | 1.621 | 1.71 |
| 4.649999999999838 | 1.559 | 1.622 | 1.711 |
| 4.654999999999839 | 1.56 | 1.623 | 1.712 |
| 4.659999999999838 | 1.562 | 1.624 | 1.712 |
| 4.664999999999838 | 1.563 | 1.624 | 1.713 |
| 4.669999999999838 | 1.564 | 1.625 | 1.714 |
| 4.674999999999838 | 1.565 | 1.626 | 1.715 |
| 4.679999999999837 | 1.566 | 1.627 | 1.715 |
| 4.684999999999838 | 1.567 | 1.628 | 1.716 |
| 4.689999999999837 | 1.568 | 1.629 | 1.717 |
| 4.694999999999838 | 1.569 | 1.63 | 1.718 |
| 4.699999999999837 | 1.57 | 1.631 | 1.718 |
| 4.704999999999837 | 1.571 | 1.632 | 1.719 |
| 4.709999999999837 | 1.572 | 1.633 | 1.72 |
| 4.714999999999837 | 1.573 | 1.633 | 1.721 |
| 4.719999999999837 | 1.574 | 1.634 | 1.721 |
| 4.724999999999837 | 1.575 | 1.635 | 1.722 |
| 4.729999999999836 | 1.576 | 1.636 | 1.723 |
| 4.734999999999836 | 1.577 | 1.637 | 1.724 |
| 4.739999999999836 | 1.578 | 1.638 | 1.724 |
| 4.744999999999836 | 1.579 | 1.639 | 1.725 |
| 4.749999999999836 | 1.58 | 1.64 | 1.726 |
| 4.754999999999836 | 1.581 | 1.641 | 1.727 |
| 4.759999999999836 | 1.582 | 1.642 | 1.727 |
| 4.764999999999836 | 1.583 | 1.642 | 1.728 |
| 4.769999999999836 | 1.584 | 1.643 | 1.729 |
| 4.774999999999835 | 1.585 | 1.644 | 1.73 |
| 4.779999999999835 | 1.586 | 1.645 | 1.73 |
| 4.784999999999835 | 1.587 | 1.646 | 1.731 |
| 4.789999999999835 | 1.588 | 1.647 | 1.732 |
| 4.794999999999835 | 1.589 | 1.648 | 1.733 |
| 4.799999999999835 | 1.59 | 1.649 | 1.733 |
| 4.804999999999835 | 1.591 | 1.65 | 1.734 |
| 4.809999999999835 | 1.592 | 1.65 | 1.735 |
| 4.814999999999835 | 1.593 | 1.651 | 1.736 |
| 4.819999999999835 | 1.594 | 1.652 | 1.736 |
| 4.824999999999835 | 1.595 | 1.653 | 1.737 |
| 4.829999999999834 | 1.596 | 1.654 | 1.738 |
| 4.834999999999834 | 1.597 | 1.655 | 1.739 |
| 4.839999999999834 | 1.598 | 1.656 | 1.739 |
| 4.844999999999834 | 1.599 | 1.657 | 1.74 |
| 4.849999999999834 | 1.6 | 1.658 | 1.741 |
| 4.854999999999834 | 1.601 | 1.658 | 1.742 |
| 4.859999999999834 | 1.602 | 1.659 | 1.742 |
| 4.864999999999834 | 1.603 | 1.66 | 1.743 |
| 4.869999999999834 | 1.604 | 1.661 | 1.744 |
| 4.874999999999834 | 1.605 | 1.662 | 1.745 |
| 4.879999999999833 | 1.606 | 1.663 | 1.745 |
| 4.884999999999834 | 1.607 | 1.664 | 1.746 |
| 4.889999999999833 | 1.608 | 1.665 | 1.747 |
| 4.894999999999833 | 1.609 | 1.665 | 1.748 |
| 4.899999999999833 | 1.61 | 1.666 | 1.748 |
| 4.904999999999833 | 1.611 | 1.667 | 1.749 |
| 4.909999999999833 | 1.612 | 1.668 | 1.75 |
| 4.914999999999833 | 1.613 | 1.669 | 1.751 |
| 4.919999999999832 | 1.614 | 1.67 | 1.751 |
| 4.924999999999833 | 1.615 | 1.671 | 1.752 |
| 4.929999999999832 | 1.615 | 1.672 | 1.753 |
| 4.934999999999832 | 1.616 | 1.672 | 1.754 |
| 4.939999999999832 | 1.617 | 1.673 | 1.754 |
| 4.944999999999832 | 1.618 | 1.674 | 1.755 |
| 4.949999999999832 | 1.619 | 1.675 | 1.756 |
| 4.954999999999832 | 1.62 | 1.676 | 1.757 |
| 4.959999999999832 | 1.621 | 1.677 | 1.757 |
| 4.964999999999832 | 1.622 | 1.678 | 1.758 |
| 4.969999999999831 | 1.623 | 1.678 | 1.759 |
| 4.974999999999831 | 1.624 | 1.679 | 1.759 |
| 4.97999999999983 | 1.625 | 1.68 | 1.76 |
| 4.984999999999831 | 1.626 | 1.681 | 1.761 |
| 4.98999999999983 | 1.627 | 1.682 | 1.762 |
| 4.994999999999831 | 1.628 | 1.683 | 1.762 |
| 4.99999999999983 | 1.629 | 1.684 | 1.763 |